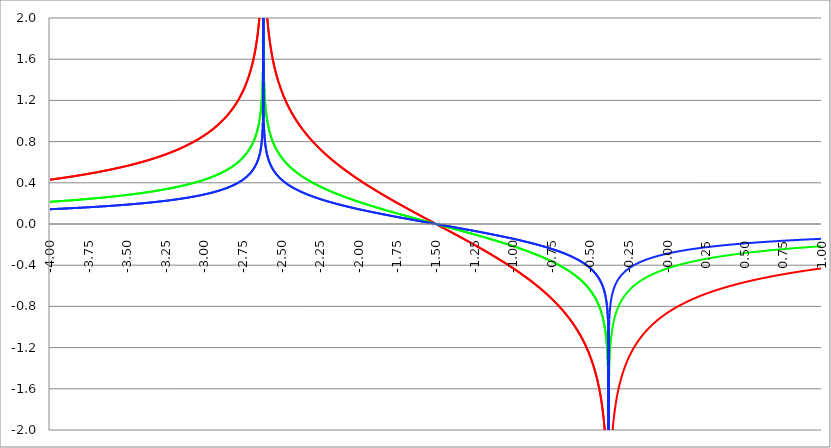
| Category | Series 1 | Series 0 | Series 2 |
|---|---|---|---|
| -4.0 | 0.43 | 0.215 | 0.143 |
| -3.9975 | 0.431 | 0.215 | 0.144 |
| -3.995 | 0.431 | 0.216 | 0.144 |
| -3.9925 | 0.432 | 0.216 | 0.144 |
| -3.99 | 0.432 | 0.216 | 0.144 |
| -3.9875 | 0.433 | 0.216 | 0.144 |
| -3.985 | 0.433 | 0.217 | 0.144 |
| -3.9825 | 0.434 | 0.217 | 0.145 |
| -3.98 | 0.434 | 0.217 | 0.145 |
| -3.9775 | 0.435 | 0.217 | 0.145 |
| -3.975000000000001 | 0.435 | 0.218 | 0.145 |
| -3.972500000000001 | 0.436 | 0.218 | 0.145 |
| -3.970000000000001 | 0.437 | 0.218 | 0.146 |
| -3.967500000000001 | 0.437 | 0.219 | 0.146 |
| -3.965000000000001 | 0.438 | 0.219 | 0.146 |
| -3.962500000000001 | 0.438 | 0.219 | 0.146 |
| -3.960000000000001 | 0.439 | 0.219 | 0.146 |
| -3.957500000000001 | 0.439 | 0.22 | 0.146 |
| -3.955000000000001 | 0.44 | 0.22 | 0.147 |
| -3.952500000000001 | 0.44 | 0.22 | 0.147 |
| -3.950000000000001 | 0.441 | 0.22 | 0.147 |
| -3.947500000000001 | 0.441 | 0.221 | 0.147 |
| -3.945000000000001 | 0.442 | 0.221 | 0.147 |
| -3.942500000000001 | 0.442 | 0.221 | 0.147 |
| -3.940000000000001 | 0.443 | 0.221 | 0.148 |
| -3.937500000000001 | 0.443 | 0.222 | 0.148 |
| -3.935000000000001 | 0.444 | 0.222 | 0.148 |
| -3.932500000000001 | 0.444 | 0.222 | 0.148 |
| -3.930000000000001 | 0.445 | 0.222 | 0.148 |
| -3.927500000000002 | 0.445 | 0.223 | 0.148 |
| -3.925000000000002 | 0.446 | 0.223 | 0.149 |
| -3.922500000000002 | 0.447 | 0.223 | 0.149 |
| -3.920000000000002 | 0.447 | 0.224 | 0.149 |
| -3.917500000000002 | 0.448 | 0.224 | 0.149 |
| -3.915000000000002 | 0.448 | 0.224 | 0.149 |
| -3.912500000000002 | 0.449 | 0.224 | 0.15 |
| -3.910000000000002 | 0.449 | 0.225 | 0.15 |
| -3.907500000000002 | 0.45 | 0.225 | 0.15 |
| -3.905000000000002 | 0.45 | 0.225 | 0.15 |
| -3.902500000000002 | 0.451 | 0.225 | 0.15 |
| -3.900000000000002 | 0.451 | 0.226 | 0.15 |
| -3.897500000000002 | 0.452 | 0.226 | 0.151 |
| -3.895000000000002 | 0.453 | 0.226 | 0.151 |
| -3.892500000000002 | 0.453 | 0.227 | 0.151 |
| -3.890000000000002 | 0.454 | 0.227 | 0.151 |
| -3.887500000000002 | 0.454 | 0.227 | 0.151 |
| -3.885000000000002 | 0.455 | 0.227 | 0.152 |
| -3.882500000000002 | 0.455 | 0.228 | 0.152 |
| -3.880000000000002 | 0.456 | 0.228 | 0.152 |
| -3.877500000000003 | 0.457 | 0.228 | 0.152 |
| -3.875000000000003 | 0.457 | 0.229 | 0.152 |
| -3.872500000000003 | 0.458 | 0.229 | 0.153 |
| -3.870000000000003 | 0.458 | 0.229 | 0.153 |
| -3.867500000000003 | 0.459 | 0.229 | 0.153 |
| -3.865000000000003 | 0.459 | 0.23 | 0.153 |
| -3.862500000000003 | 0.46 | 0.23 | 0.153 |
| -3.860000000000003 | 0.461 | 0.23 | 0.154 |
| -3.857500000000003 | 0.461 | 0.231 | 0.154 |
| -3.855000000000003 | 0.462 | 0.231 | 0.154 |
| -3.852500000000003 | 0.462 | 0.231 | 0.154 |
| -3.850000000000003 | 0.463 | 0.231 | 0.154 |
| -3.847500000000003 | 0.463 | 0.232 | 0.154 |
| -3.845000000000003 | 0.464 | 0.232 | 0.155 |
| -3.842500000000003 | 0.465 | 0.232 | 0.155 |
| -3.840000000000003 | 0.465 | 0.233 | 0.155 |
| -3.837500000000003 | 0.466 | 0.233 | 0.155 |
| -3.835000000000003 | 0.466 | 0.233 | 0.155 |
| -3.832500000000004 | 0.467 | 0.233 | 0.156 |
| -3.830000000000004 | 0.468 | 0.234 | 0.156 |
| -3.827500000000004 | 0.468 | 0.234 | 0.156 |
| -3.825000000000004 | 0.469 | 0.234 | 0.156 |
| -3.822500000000004 | 0.469 | 0.235 | 0.156 |
| -3.820000000000004 | 0.47 | 0.235 | 0.157 |
| -3.817500000000004 | 0.471 | 0.235 | 0.157 |
| -3.815000000000004 | 0.471 | 0.236 | 0.157 |
| -3.812500000000004 | 0.472 | 0.236 | 0.157 |
| -3.810000000000004 | 0.472 | 0.236 | 0.157 |
| -3.807500000000004 | 0.473 | 0.237 | 0.158 |
| -3.805000000000004 | 0.474 | 0.237 | 0.158 |
| -3.802500000000004 | 0.474 | 0.237 | 0.158 |
| -3.800000000000004 | 0.475 | 0.237 | 0.158 |
| -3.797500000000004 | 0.476 | 0.238 | 0.159 |
| -3.795000000000004 | 0.476 | 0.238 | 0.159 |
| -3.792500000000004 | 0.477 | 0.238 | 0.159 |
| -3.790000000000004 | 0.477 | 0.239 | 0.159 |
| -3.787500000000004 | 0.478 | 0.239 | 0.159 |
| -3.785000000000004 | 0.479 | 0.239 | 0.16 |
| -3.782500000000005 | 0.479 | 0.24 | 0.16 |
| -3.780000000000005 | 0.48 | 0.24 | 0.16 |
| -3.777500000000005 | 0.481 | 0.24 | 0.16 |
| -3.775000000000005 | 0.481 | 0.241 | 0.16 |
| -3.772500000000005 | 0.482 | 0.241 | 0.161 |
| -3.770000000000005 | 0.482 | 0.241 | 0.161 |
| -3.767500000000005 | 0.483 | 0.242 | 0.161 |
| -3.765000000000005 | 0.484 | 0.242 | 0.161 |
| -3.762500000000005 | 0.484 | 0.242 | 0.161 |
| -3.760000000000005 | 0.485 | 0.243 | 0.162 |
| -3.757500000000005 | 0.486 | 0.243 | 0.162 |
| -3.755000000000005 | 0.486 | 0.243 | 0.162 |
| -3.752500000000005 | 0.487 | 0.243 | 0.162 |
| -3.750000000000005 | 0.488 | 0.244 | 0.163 |
| -3.747500000000005 | 0.488 | 0.244 | 0.163 |
| -3.745000000000005 | 0.489 | 0.244 | 0.163 |
| -3.742500000000005 | 0.49 | 0.245 | 0.163 |
| -3.740000000000005 | 0.49 | 0.245 | 0.163 |
| -3.737500000000006 | 0.491 | 0.245 | 0.164 |
| -3.735000000000006 | 0.492 | 0.246 | 0.164 |
| -3.732500000000006 | 0.492 | 0.246 | 0.164 |
| -3.730000000000006 | 0.493 | 0.246 | 0.164 |
| -3.727500000000006 | 0.494 | 0.247 | 0.165 |
| -3.725000000000006 | 0.494 | 0.247 | 0.165 |
| -3.722500000000006 | 0.495 | 0.247 | 0.165 |
| -3.720000000000006 | 0.496 | 0.248 | 0.165 |
| -3.717500000000006 | 0.496 | 0.248 | 0.165 |
| -3.715000000000006 | 0.497 | 0.249 | 0.166 |
| -3.712500000000006 | 0.498 | 0.249 | 0.166 |
| -3.710000000000006 | 0.498 | 0.249 | 0.166 |
| -3.707500000000006 | 0.499 | 0.25 | 0.166 |
| -3.705000000000006 | 0.5 | 0.25 | 0.167 |
| -3.702500000000006 | 0.5 | 0.25 | 0.167 |
| -3.700000000000006 | 0.501 | 0.251 | 0.167 |
| -3.697500000000006 | 0.502 | 0.251 | 0.167 |
| -3.695000000000006 | 0.503 | 0.251 | 0.168 |
| -3.692500000000006 | 0.503 | 0.252 | 0.168 |
| -3.690000000000006 | 0.504 | 0.252 | 0.168 |
| -3.687500000000006 | 0.505 | 0.252 | 0.168 |
| -3.685000000000007 | 0.505 | 0.253 | 0.168 |
| -3.682500000000007 | 0.506 | 0.253 | 0.169 |
| -3.680000000000007 | 0.507 | 0.253 | 0.169 |
| -3.677500000000007 | 0.507 | 0.254 | 0.169 |
| -3.675000000000007 | 0.508 | 0.254 | 0.169 |
| -3.672500000000007 | 0.509 | 0.254 | 0.17 |
| -3.670000000000007 | 0.51 | 0.255 | 0.17 |
| -3.667500000000007 | 0.51 | 0.255 | 0.17 |
| -3.665000000000007 | 0.511 | 0.256 | 0.17 |
| -3.662500000000007 | 0.512 | 0.256 | 0.171 |
| -3.660000000000007 | 0.513 | 0.256 | 0.171 |
| -3.657500000000007 | 0.513 | 0.257 | 0.171 |
| -3.655000000000007 | 0.514 | 0.257 | 0.171 |
| -3.652500000000007 | 0.515 | 0.257 | 0.172 |
| -3.650000000000007 | 0.516 | 0.258 | 0.172 |
| -3.647500000000007 | 0.516 | 0.258 | 0.172 |
| -3.645000000000007 | 0.517 | 0.259 | 0.172 |
| -3.642500000000008 | 0.518 | 0.259 | 0.173 |
| -3.640000000000008 | 0.518 | 0.259 | 0.173 |
| -3.637500000000008 | 0.519 | 0.26 | 0.173 |
| -3.635000000000008 | 0.52 | 0.26 | 0.173 |
| -3.632500000000008 | 0.521 | 0.26 | 0.174 |
| -3.630000000000008 | 0.522 | 0.261 | 0.174 |
| -3.627500000000008 | 0.522 | 0.261 | 0.174 |
| -3.625000000000008 | 0.523 | 0.262 | 0.174 |
| -3.622500000000008 | 0.524 | 0.262 | 0.175 |
| -3.620000000000008 | 0.525 | 0.262 | 0.175 |
| -3.617500000000008 | 0.525 | 0.263 | 0.175 |
| -3.615000000000008 | 0.526 | 0.263 | 0.175 |
| -3.612500000000008 | 0.527 | 0.263 | 0.176 |
| -3.610000000000008 | 0.528 | 0.264 | 0.176 |
| -3.607500000000008 | 0.528 | 0.264 | 0.176 |
| -3.605000000000008 | 0.529 | 0.265 | 0.176 |
| -3.602500000000008 | 0.53 | 0.265 | 0.177 |
| -3.600000000000008 | 0.531 | 0.265 | 0.177 |
| -3.597500000000009 | 0.532 | 0.266 | 0.177 |
| -3.595000000000009 | 0.532 | 0.266 | 0.177 |
| -3.592500000000009 | 0.533 | 0.267 | 0.178 |
| -3.590000000000009 | 0.534 | 0.267 | 0.178 |
| -3.587500000000009 | 0.535 | 0.267 | 0.178 |
| -3.585000000000009 | 0.536 | 0.268 | 0.179 |
| -3.582500000000009 | 0.536 | 0.268 | 0.179 |
| -3.580000000000009 | 0.537 | 0.269 | 0.179 |
| -3.577500000000009 | 0.538 | 0.269 | 0.179 |
| -3.575000000000009 | 0.539 | 0.269 | 0.18 |
| -3.572500000000009 | 0.54 | 0.27 | 0.18 |
| -3.570000000000009 | 0.541 | 0.27 | 0.18 |
| -3.56750000000001 | 0.541 | 0.271 | 0.18 |
| -3.565000000000009 | 0.542 | 0.271 | 0.181 |
| -3.562500000000009 | 0.543 | 0.271 | 0.181 |
| -3.560000000000009 | 0.544 | 0.272 | 0.181 |
| -3.557500000000009 | 0.545 | 0.272 | 0.182 |
| -3.555000000000009 | 0.546 | 0.273 | 0.182 |
| -3.55250000000001 | 0.546 | 0.273 | 0.182 |
| -3.55000000000001 | 0.547 | 0.274 | 0.182 |
| -3.54750000000001 | 0.548 | 0.274 | 0.183 |
| -3.54500000000001 | 0.549 | 0.274 | 0.183 |
| -3.54250000000001 | 0.55 | 0.275 | 0.183 |
| -3.54000000000001 | 0.551 | 0.275 | 0.184 |
| -3.53750000000001 | 0.551 | 0.276 | 0.184 |
| -3.53500000000001 | 0.552 | 0.276 | 0.184 |
| -3.53250000000001 | 0.553 | 0.277 | 0.184 |
| -3.53000000000001 | 0.554 | 0.277 | 0.185 |
| -3.52750000000001 | 0.555 | 0.277 | 0.185 |
| -3.52500000000001 | 0.556 | 0.278 | 0.185 |
| -3.52250000000001 | 0.557 | 0.278 | 0.186 |
| -3.52000000000001 | 0.558 | 0.279 | 0.186 |
| -3.51750000000001 | 0.558 | 0.279 | 0.186 |
| -3.51500000000001 | 0.559 | 0.28 | 0.186 |
| -3.51250000000001 | 0.56 | 0.28 | 0.187 |
| -3.51000000000001 | 0.561 | 0.281 | 0.187 |
| -3.50750000000001 | 0.562 | 0.281 | 0.187 |
| -3.505000000000011 | 0.563 | 0.281 | 0.188 |
| -3.502500000000011 | 0.564 | 0.282 | 0.188 |
| -3.500000000000011 | 0.565 | 0.282 | 0.188 |
| -3.497500000000011 | 0.566 | 0.283 | 0.189 |
| -3.495000000000011 | 0.567 | 0.283 | 0.189 |
| -3.492500000000011 | 0.567 | 0.284 | 0.189 |
| -3.490000000000011 | 0.568 | 0.284 | 0.189 |
| -3.487500000000011 | 0.569 | 0.285 | 0.19 |
| -3.485000000000011 | 0.57 | 0.285 | 0.19 |
| -3.482500000000011 | 0.571 | 0.286 | 0.19 |
| -3.480000000000011 | 0.572 | 0.286 | 0.191 |
| -3.477500000000011 | 0.573 | 0.287 | 0.191 |
| -3.475000000000011 | 0.574 | 0.287 | 0.191 |
| -3.472500000000011 | 0.575 | 0.287 | 0.192 |
| -3.470000000000011 | 0.576 | 0.288 | 0.192 |
| -3.467500000000011 | 0.577 | 0.288 | 0.192 |
| -3.465000000000011 | 0.578 | 0.289 | 0.193 |
| -3.462500000000011 | 0.579 | 0.289 | 0.193 |
| -3.460000000000011 | 0.58 | 0.29 | 0.193 |
| -3.457500000000012 | 0.581 | 0.29 | 0.194 |
| -3.455000000000012 | 0.582 | 0.291 | 0.194 |
| -3.452500000000012 | 0.583 | 0.291 | 0.194 |
| -3.450000000000012 | 0.584 | 0.292 | 0.195 |
| -3.447500000000012 | 0.585 | 0.292 | 0.195 |
| -3.445000000000012 | 0.586 | 0.293 | 0.195 |
| -3.442500000000012 | 0.587 | 0.293 | 0.196 |
| -3.440000000000012 | 0.588 | 0.294 | 0.196 |
| -3.437500000000012 | 0.589 | 0.294 | 0.196 |
| -3.435000000000012 | 0.59 | 0.295 | 0.197 |
| -3.432500000000012 | 0.591 | 0.295 | 0.197 |
| -3.430000000000012 | 0.592 | 0.296 | 0.197 |
| -3.427500000000012 | 0.593 | 0.296 | 0.198 |
| -3.425000000000012 | 0.594 | 0.297 | 0.198 |
| -3.422500000000012 | 0.595 | 0.297 | 0.198 |
| -3.420000000000012 | 0.596 | 0.298 | 0.199 |
| -3.417500000000012 | 0.597 | 0.298 | 0.199 |
| -3.415000000000012 | 0.598 | 0.299 | 0.199 |
| -3.412500000000012 | 0.599 | 0.299 | 0.2 |
| -3.410000000000013 | 0.6 | 0.3 | 0.2 |
| -3.407500000000012 | 0.601 | 0.3 | 0.2 |
| -3.405000000000013 | 0.602 | 0.301 | 0.201 |
| -3.402500000000013 | 0.603 | 0.301 | 0.201 |
| -3.400000000000013 | 0.604 | 0.302 | 0.201 |
| -3.397500000000013 | 0.605 | 0.303 | 0.202 |
| -3.395000000000013 | 0.606 | 0.303 | 0.202 |
| -3.392500000000013 | 0.607 | 0.304 | 0.202 |
| -3.390000000000013 | 0.608 | 0.304 | 0.203 |
| -3.387500000000013 | 0.609 | 0.305 | 0.203 |
| -3.385000000000013 | 0.61 | 0.305 | 0.203 |
| -3.382500000000013 | 0.612 | 0.306 | 0.204 |
| -3.380000000000013 | 0.613 | 0.306 | 0.204 |
| -3.377500000000013 | 0.614 | 0.307 | 0.205 |
| -3.375000000000013 | 0.615 | 0.307 | 0.205 |
| -3.372500000000013 | 0.616 | 0.308 | 0.205 |
| -3.370000000000013 | 0.617 | 0.309 | 0.206 |
| -3.367500000000013 | 0.618 | 0.309 | 0.206 |
| -3.365000000000013 | 0.619 | 0.31 | 0.206 |
| -3.362500000000014 | 0.62 | 0.31 | 0.207 |
| -3.360000000000014 | 0.621 | 0.311 | 0.207 |
| -3.357500000000014 | 0.623 | 0.311 | 0.208 |
| -3.355000000000014 | 0.624 | 0.312 | 0.208 |
| -3.352500000000014 | 0.625 | 0.312 | 0.208 |
| -3.350000000000014 | 0.626 | 0.313 | 0.209 |
| -3.347500000000014 | 0.627 | 0.314 | 0.209 |
| -3.345000000000014 | 0.628 | 0.314 | 0.209 |
| -3.342500000000014 | 0.63 | 0.315 | 0.21 |
| -3.340000000000014 | 0.631 | 0.315 | 0.21 |
| -3.337500000000014 | 0.632 | 0.316 | 0.211 |
| -3.335000000000014 | 0.633 | 0.317 | 0.211 |
| -3.332500000000014 | 0.634 | 0.317 | 0.211 |
| -3.330000000000014 | 0.635 | 0.318 | 0.212 |
| -3.327500000000014 | 0.637 | 0.318 | 0.212 |
| -3.325000000000014 | 0.638 | 0.319 | 0.213 |
| -3.322500000000014 | 0.639 | 0.32 | 0.213 |
| -3.320000000000014 | 0.64 | 0.32 | 0.213 |
| -3.317500000000015 | 0.641 | 0.321 | 0.214 |
| -3.315000000000015 | 0.643 | 0.321 | 0.214 |
| -3.312500000000015 | 0.644 | 0.322 | 0.215 |
| -3.310000000000015 | 0.645 | 0.323 | 0.215 |
| -3.307500000000015 | 0.646 | 0.323 | 0.215 |
| -3.305000000000015 | 0.648 | 0.324 | 0.216 |
| -3.302500000000015 | 0.649 | 0.324 | 0.216 |
| -3.300000000000015 | 0.65 | 0.325 | 0.217 |
| -3.297500000000015 | 0.651 | 0.326 | 0.217 |
| -3.295000000000015 | 0.653 | 0.326 | 0.218 |
| -3.292500000000015 | 0.654 | 0.327 | 0.218 |
| -3.290000000000015 | 0.655 | 0.328 | 0.218 |
| -3.287500000000015 | 0.656 | 0.328 | 0.219 |
| -3.285000000000015 | 0.658 | 0.329 | 0.219 |
| -3.282500000000015 | 0.659 | 0.33 | 0.22 |
| -3.280000000000015 | 0.66 | 0.33 | 0.22 |
| -3.277500000000015 | 0.662 | 0.331 | 0.221 |
| -3.275000000000015 | 0.663 | 0.331 | 0.221 |
| -3.272500000000015 | 0.664 | 0.332 | 0.221 |
| -3.270000000000016 | 0.666 | 0.333 | 0.222 |
| -3.267500000000015 | 0.667 | 0.333 | 0.222 |
| -3.265000000000016 | 0.668 | 0.334 | 0.223 |
| -3.262500000000016 | 0.67 | 0.335 | 0.223 |
| -3.260000000000016 | 0.671 | 0.335 | 0.224 |
| -3.257500000000016 | 0.672 | 0.336 | 0.224 |
| -3.255000000000016 | 0.674 | 0.337 | 0.225 |
| -3.252500000000016 | 0.675 | 0.338 | 0.225 |
| -3.250000000000016 | 0.676 | 0.338 | 0.225 |
| -3.247500000000016 | 0.678 | 0.339 | 0.226 |
| -3.245000000000016 | 0.679 | 0.34 | 0.226 |
| -3.242500000000016 | 0.681 | 0.34 | 0.227 |
| -3.240000000000016 | 0.682 | 0.341 | 0.227 |
| -3.237500000000016 | 0.683 | 0.342 | 0.228 |
| -3.235000000000016 | 0.685 | 0.342 | 0.228 |
| -3.232500000000016 | 0.686 | 0.343 | 0.229 |
| -3.230000000000016 | 0.688 | 0.344 | 0.229 |
| -3.227500000000016 | 0.689 | 0.345 | 0.23 |
| -3.225000000000016 | 0.691 | 0.345 | 0.23 |
| -3.222500000000016 | 0.692 | 0.346 | 0.231 |
| -3.220000000000016 | 0.693 | 0.347 | 0.231 |
| -3.217500000000016 | 0.695 | 0.347 | 0.232 |
| -3.215000000000017 | 0.696 | 0.348 | 0.232 |
| -3.212500000000017 | 0.698 | 0.349 | 0.233 |
| -3.210000000000017 | 0.699 | 0.35 | 0.233 |
| -3.207500000000016 | 0.701 | 0.35 | 0.234 |
| -3.205000000000017 | 0.702 | 0.351 | 0.234 |
| -3.202500000000017 | 0.704 | 0.352 | 0.235 |
| -3.200000000000017 | 0.705 | 0.353 | 0.235 |
| -3.197500000000017 | 0.707 | 0.353 | 0.236 |
| -3.195000000000017 | 0.708 | 0.354 | 0.236 |
| -3.192500000000017 | 0.71 | 0.355 | 0.237 |
| -3.190000000000017 | 0.712 | 0.356 | 0.237 |
| -3.187500000000017 | 0.713 | 0.357 | 0.238 |
| -3.185000000000017 | 0.715 | 0.357 | 0.238 |
| -3.182500000000017 | 0.716 | 0.358 | 0.239 |
| -3.180000000000017 | 0.718 | 0.359 | 0.239 |
| -3.177500000000017 | 0.719 | 0.36 | 0.24 |
| -3.175000000000018 | 0.721 | 0.361 | 0.24 |
| -3.172500000000018 | 0.723 | 0.361 | 0.241 |
| -3.170000000000018 | 0.724 | 0.362 | 0.241 |
| -3.167500000000017 | 0.726 | 0.363 | 0.242 |
| -3.165000000000018 | 0.728 | 0.364 | 0.243 |
| -3.162500000000018 | 0.729 | 0.365 | 0.243 |
| -3.160000000000018 | 0.731 | 0.365 | 0.244 |
| -3.157500000000018 | 0.733 | 0.366 | 0.244 |
| -3.155000000000018 | 0.734 | 0.367 | 0.245 |
| -3.152500000000018 | 0.736 | 0.368 | 0.245 |
| -3.150000000000018 | 0.738 | 0.369 | 0.246 |
| -3.147500000000018 | 0.739 | 0.37 | 0.246 |
| -3.145000000000018 | 0.741 | 0.371 | 0.247 |
| -3.142500000000018 | 0.743 | 0.371 | 0.248 |
| -3.140000000000018 | 0.744 | 0.372 | 0.248 |
| -3.137500000000018 | 0.746 | 0.373 | 0.249 |
| -3.135000000000018 | 0.748 | 0.374 | 0.249 |
| -3.132500000000018 | 0.75 | 0.375 | 0.25 |
| -3.130000000000019 | 0.751 | 0.376 | 0.25 |
| -3.127500000000018 | 0.753 | 0.377 | 0.251 |
| -3.125000000000019 | 0.755 | 0.378 | 0.252 |
| -3.122500000000019 | 0.757 | 0.378 | 0.252 |
| -3.120000000000019 | 0.759 | 0.379 | 0.253 |
| -3.117500000000019 | 0.761 | 0.38 | 0.254 |
| -3.115000000000019 | 0.762 | 0.381 | 0.254 |
| -3.112500000000019 | 0.764 | 0.382 | 0.255 |
| -3.110000000000019 | 0.766 | 0.383 | 0.255 |
| -3.10750000000002 | 0.768 | 0.384 | 0.256 |
| -3.10500000000002 | 0.77 | 0.385 | 0.257 |
| -3.10250000000002 | 0.772 | 0.386 | 0.257 |
| -3.10000000000002 | 0.774 | 0.387 | 0.258 |
| -3.09750000000002 | 0.776 | 0.388 | 0.259 |
| -3.095000000000019 | 0.777 | 0.389 | 0.259 |
| -3.092500000000019 | 0.779 | 0.39 | 0.26 |
| -3.090000000000019 | 0.781 | 0.391 | 0.26 |
| -3.08750000000002 | 0.783 | 0.392 | 0.261 |
| -3.085000000000019 | 0.785 | 0.393 | 0.262 |
| -3.08250000000002 | 0.787 | 0.394 | 0.262 |
| -3.08000000000002 | 0.789 | 0.395 | 0.263 |
| -3.07750000000002 | 0.791 | 0.396 | 0.264 |
| -3.07500000000002 | 0.793 | 0.397 | 0.264 |
| -3.07250000000002 | 0.795 | 0.398 | 0.265 |
| -3.07000000000002 | 0.797 | 0.399 | 0.266 |
| -3.06750000000002 | 0.799 | 0.4 | 0.266 |
| -3.06500000000002 | 0.802 | 0.401 | 0.267 |
| -3.06250000000002 | 0.804 | 0.402 | 0.268 |
| -3.06000000000002 | 0.806 | 0.403 | 0.269 |
| -3.05750000000002 | 0.808 | 0.404 | 0.269 |
| -3.05500000000002 | 0.81 | 0.405 | 0.27 |
| -3.05250000000002 | 0.812 | 0.406 | 0.271 |
| -3.05000000000002 | 0.814 | 0.407 | 0.271 |
| -3.04750000000002 | 0.816 | 0.408 | 0.272 |
| -3.04500000000002 | 0.819 | 0.409 | 0.273 |
| -3.04250000000002 | 0.821 | 0.41 | 0.274 |
| -3.04000000000002 | 0.823 | 0.412 | 0.274 |
| -3.037500000000021 | 0.825 | 0.413 | 0.275 |
| -3.035000000000021 | 0.828 | 0.414 | 0.276 |
| -3.032500000000021 | 0.83 | 0.415 | 0.277 |
| -3.030000000000021 | 0.832 | 0.416 | 0.277 |
| -3.027500000000021 | 0.834 | 0.417 | 0.278 |
| -3.025000000000021 | 0.837 | 0.418 | 0.279 |
| -3.022500000000021 | 0.839 | 0.42 | 0.28 |
| -3.020000000000021 | 0.841 | 0.421 | 0.28 |
| -3.017500000000021 | 0.844 | 0.422 | 0.281 |
| -3.015000000000021 | 0.846 | 0.423 | 0.282 |
| -3.012500000000021 | 0.849 | 0.424 | 0.283 |
| -3.010000000000021 | 0.851 | 0.425 | 0.284 |
| -3.007500000000021 | 0.853 | 0.427 | 0.284 |
| -3.005000000000021 | 0.856 | 0.428 | 0.285 |
| -3.002500000000021 | 0.858 | 0.429 | 0.286 |
| -3.000000000000021 | 0.861 | 0.43 | 0.287 |
| -2.997500000000021 | 0.863 | 0.432 | 0.288 |
| -2.995000000000021 | 0.866 | 0.433 | 0.289 |
| -2.992500000000021 | 0.868 | 0.434 | 0.289 |
| -2.990000000000021 | 0.871 | 0.435 | 0.29 |
| -2.987500000000022 | 0.874 | 0.437 | 0.291 |
| -2.985000000000022 | 0.876 | 0.438 | 0.292 |
| -2.982500000000022 | 0.879 | 0.439 | 0.293 |
| -2.980000000000022 | 0.881 | 0.441 | 0.294 |
| -2.977500000000022 | 0.884 | 0.442 | 0.295 |
| -2.975000000000022 | 0.887 | 0.443 | 0.296 |
| -2.972500000000022 | 0.89 | 0.445 | 0.297 |
| -2.970000000000022 | 0.892 | 0.446 | 0.297 |
| -2.967500000000022 | 0.895 | 0.448 | 0.298 |
| -2.965000000000022 | 0.898 | 0.449 | 0.299 |
| -2.962500000000022 | 0.901 | 0.45 | 0.3 |
| -2.960000000000022 | 0.903 | 0.452 | 0.301 |
| -2.957500000000022 | 0.906 | 0.453 | 0.302 |
| -2.955000000000022 | 0.909 | 0.455 | 0.303 |
| -2.952500000000022 | 0.912 | 0.456 | 0.304 |
| -2.950000000000022 | 0.915 | 0.457 | 0.305 |
| -2.947500000000022 | 0.918 | 0.459 | 0.306 |
| -2.945000000000022 | 0.921 | 0.46 | 0.307 |
| -2.942500000000023 | 0.924 | 0.462 | 0.308 |
| -2.940000000000023 | 0.927 | 0.463 | 0.309 |
| -2.937500000000023 | 0.93 | 0.465 | 0.31 |
| -2.935000000000023 | 0.933 | 0.466 | 0.311 |
| -2.932500000000023 | 0.936 | 0.468 | 0.312 |
| -2.930000000000023 | 0.939 | 0.47 | 0.313 |
| -2.927500000000023 | 0.942 | 0.471 | 0.314 |
| -2.925000000000023 | 0.946 | 0.473 | 0.315 |
| -2.922500000000023 | 0.949 | 0.474 | 0.316 |
| -2.920000000000023 | 0.952 | 0.476 | 0.317 |
| -2.917500000000023 | 0.955 | 0.478 | 0.318 |
| -2.915000000000023 | 0.959 | 0.479 | 0.32 |
| -2.912500000000023 | 0.962 | 0.481 | 0.321 |
| -2.910000000000023 | 0.965 | 0.483 | 0.322 |
| -2.907500000000023 | 0.969 | 0.484 | 0.323 |
| -2.905000000000023 | 0.972 | 0.486 | 0.324 |
| -2.902500000000023 | 0.976 | 0.488 | 0.325 |
| -2.900000000000023 | 0.979 | 0.49 | 0.326 |
| -2.897500000000023 | 0.983 | 0.491 | 0.328 |
| -2.895000000000023 | 0.986 | 0.493 | 0.329 |
| -2.892500000000024 | 0.99 | 0.495 | 0.33 |
| -2.890000000000024 | 0.994 | 0.497 | 0.331 |
| -2.887500000000024 | 0.997 | 0.499 | 0.332 |
| -2.885000000000024 | 1.001 | 0.5 | 0.334 |
| -2.882500000000024 | 1.005 | 0.502 | 0.335 |
| -2.880000000000024 | 1.008 | 0.504 | 0.336 |
| -2.877500000000024 | 1.012 | 0.506 | 0.337 |
| -2.875000000000024 | 1.016 | 0.508 | 0.339 |
| -2.872500000000024 | 1.02 | 0.51 | 0.34 |
| -2.870000000000024 | 1.024 | 0.512 | 0.341 |
| -2.867500000000024 | 1.028 | 0.514 | 0.343 |
| -2.865000000000024 | 1.032 | 0.516 | 0.344 |
| -2.862500000000024 | 1.036 | 0.518 | 0.345 |
| -2.860000000000024 | 1.04 | 0.52 | 0.347 |
| -2.857500000000024 | 1.045 | 0.522 | 0.348 |
| -2.855000000000024 | 1.049 | 0.524 | 0.35 |
| -2.852500000000024 | 1.053 | 0.527 | 0.351 |
| -2.850000000000024 | 1.057 | 0.529 | 0.352 |
| -2.847500000000025 | 1.062 | 0.531 | 0.354 |
| -2.845000000000025 | 1.066 | 0.533 | 0.355 |
| -2.842500000000025 | 1.071 | 0.535 | 0.357 |
| -2.840000000000025 | 1.075 | 0.538 | 0.358 |
| -2.837500000000025 | 1.08 | 0.54 | 0.36 |
| -2.835000000000025 | 1.085 | 0.542 | 0.362 |
| -2.832500000000025 | 1.089 | 0.545 | 0.363 |
| -2.830000000000025 | 1.094 | 0.547 | 0.365 |
| -2.827500000000025 | 1.099 | 0.55 | 0.366 |
| -2.825000000000025 | 1.104 | 0.552 | 0.368 |
| -2.822500000000025 | 1.109 | 0.554 | 0.37 |
| -2.820000000000025 | 1.114 | 0.557 | 0.371 |
| -2.817500000000025 | 1.119 | 0.56 | 0.373 |
| -2.815000000000025 | 1.124 | 0.562 | 0.375 |
| -2.812500000000025 | 1.129 | 0.565 | 0.376 |
| -2.810000000000025 | 1.135 | 0.567 | 0.378 |
| -2.807500000000025 | 1.14 | 0.57 | 0.38 |
| -2.805000000000025 | 1.146 | 0.573 | 0.382 |
| -2.802500000000025 | 1.151 | 0.576 | 0.384 |
| -2.800000000000026 | 1.157 | 0.578 | 0.386 |
| -2.797500000000026 | 1.163 | 0.581 | 0.388 |
| -2.795000000000026 | 1.168 | 0.584 | 0.389 |
| -2.792500000000026 | 1.174 | 0.587 | 0.391 |
| -2.790000000000026 | 1.18 | 0.59 | 0.393 |
| -2.787500000000026 | 1.186 | 0.593 | 0.395 |
| -2.785000000000026 | 1.193 | 0.596 | 0.398 |
| -2.782500000000026 | 1.199 | 0.599 | 0.4 |
| -2.780000000000026 | 1.205 | 0.603 | 0.402 |
| -2.777500000000026 | 1.212 | 0.606 | 0.404 |
| -2.775000000000026 | 1.218 | 0.609 | 0.406 |
| -2.772500000000026 | 1.225 | 0.613 | 0.408 |
| -2.770000000000026 | 1.232 | 0.616 | 0.411 |
| -2.767500000000026 | 1.239 | 0.619 | 0.413 |
| -2.765000000000026 | 1.246 | 0.623 | 0.415 |
| -2.762500000000026 | 1.253 | 0.627 | 0.418 |
| -2.760000000000026 | 1.26 | 0.63 | 0.42 |
| -2.757500000000026 | 1.268 | 0.634 | 0.423 |
| -2.755000000000026 | 1.276 | 0.638 | 0.425 |
| -2.752500000000027 | 1.283 | 0.642 | 0.428 |
| -2.750000000000027 | 1.291 | 0.646 | 0.43 |
| -2.747500000000026 | 1.299 | 0.65 | 0.433 |
| -2.745000000000027 | 1.308 | 0.654 | 0.436 |
| -2.742500000000027 | 1.316 | 0.658 | 0.439 |
| -2.740000000000027 | 1.325 | 0.662 | 0.442 |
| -2.737500000000027 | 1.333 | 0.667 | 0.444 |
| -2.735000000000027 | 1.342 | 0.671 | 0.447 |
| -2.732500000000027 | 1.352 | 0.676 | 0.451 |
| -2.730000000000027 | 1.361 | 0.68 | 0.454 |
| -2.727500000000027 | 1.371 | 0.685 | 0.457 |
| -2.725000000000027 | 1.38 | 0.69 | 0.46 |
| -2.722500000000027 | 1.391 | 0.695 | 0.464 |
| -2.720000000000027 | 1.401 | 0.7 | 0.467 |
| -2.717500000000027 | 1.411 | 0.706 | 0.47 |
| -2.715000000000027 | 1.422 | 0.711 | 0.474 |
| -2.712500000000027 | 1.434 | 0.717 | 0.478 |
| -2.710000000000027 | 1.445 | 0.723 | 0.482 |
| -2.707500000000027 | 1.457 | 0.728 | 0.486 |
| -2.705000000000028 | 1.469 | 0.735 | 0.49 |
| -2.702500000000028 | 1.482 | 0.741 | 0.494 |
| -2.700000000000028 | 1.495 | 0.747 | 0.498 |
| -2.697500000000028 | 1.508 | 0.754 | 0.503 |
| -2.695000000000028 | 1.522 | 0.761 | 0.507 |
| -2.692500000000028 | 1.536 | 0.768 | 0.512 |
| -2.690000000000028 | 1.551 | 0.775 | 0.517 |
| -2.687500000000028 | 1.566 | 0.783 | 0.522 |
| -2.685000000000028 | 1.582 | 0.791 | 0.527 |
| -2.682500000000028 | 1.599 | 0.799 | 0.533 |
| -2.680000000000028 | 1.616 | 0.808 | 0.539 |
| -2.677500000000028 | 1.634 | 0.817 | 0.545 |
| -2.675000000000028 | 1.653 | 0.826 | 0.551 |
| -2.672500000000028 | 1.672 | 0.836 | 0.557 |
| -2.670000000000028 | 1.693 | 0.846 | 0.564 |
| -2.667500000000028 | 1.714 | 0.857 | 0.571 |
| -2.665000000000028 | 1.737 | 0.868 | 0.579 |
| -2.662500000000028 | 1.761 | 0.88 | 0.587 |
| -2.660000000000028 | 1.786 | 0.893 | 0.595 |
| -2.657500000000029 | 1.813 | 0.907 | 0.604 |
| -2.655000000000029 | 1.842 | 0.921 | 0.614 |
| -2.652500000000029 | 1.873 | 0.936 | 0.624 |
| -2.650000000000029 | 1.906 | 0.953 | 0.635 |
| -2.647500000000029 | 1.942 | 0.971 | 0.647 |
| -2.645000000000029 | 1.981 | 0.991 | 0.66 |
| -2.642500000000029 | 2.024 | 1.012 | 0.675 |
| -2.640000000000029 | 2.072 | 1.036 | 0.691 |
| -2.637500000000029 | 2.125 | 1.063 | 0.708 |
| -2.635000000000029 | 2.186 | 1.093 | 0.729 |
| -2.632500000000029 | 2.257 | 1.129 | 0.752 |
| -2.630000000000029 | 2.341 | 1.171 | 0.78 |
| -2.62750000000003 | 2.446 | 1.223 | 0.815 |
| -2.625000000000029 | 2.582 | 1.291 | 0.861 |
| -2.622500000000029 | 2.781 | 1.39 | 0.927 |
| -2.620000000000029 | 3.147 | 1.574 | 1.049 |
| -2.617500000000029 | 10 | 10 | 10 |
| -2.615000000000029 | 2.952 | 1.476 | 0.984 |
| -2.612500000000029 | 2.683 | 1.341 | 0.894 |
| -2.61000000000003 | 2.516 | 1.258 | 0.839 |
| -2.60750000000003 | 2.394 | 1.197 | 0.798 |
| -2.60500000000003 | 2.298 | 1.149 | 0.766 |
| -2.60250000000003 | 2.219 | 1.11 | 0.74 |
| -2.60000000000003 | 2.152 | 1.076 | 0.717 |
| -2.59750000000003 | 2.093 | 1.047 | 0.698 |
| -2.59500000000003 | 2.042 | 1.021 | 0.681 |
| -2.59250000000003 | 1.995 | 0.998 | 0.665 |
| -2.59000000000003 | 1.953 | 0.976 | 0.651 |
| -2.58750000000003 | 1.914 | 0.957 | 0.638 |
| -2.58500000000003 | 1.878 | 0.939 | 0.626 |
| -2.58250000000003 | 1.845 | 0.923 | 0.615 |
| -2.58000000000003 | 1.814 | 0.907 | 0.605 |
| -2.57750000000003 | 1.785 | 0.893 | 0.595 |
| -2.57500000000003 | 1.758 | 0.879 | 0.586 |
| -2.57250000000003 | 1.732 | 0.866 | 0.577 |
| -2.57000000000003 | 1.708 | 0.854 | 0.569 |
| -2.56750000000003 | 1.685 | 0.842 | 0.562 |
| -2.565000000000031 | 1.663 | 0.831 | 0.554 |
| -2.562500000000031 | 1.641 | 0.821 | 0.547 |
| -2.560000000000031 | 1.621 | 0.811 | 0.54 |
| -2.557500000000031 | 1.602 | 0.801 | 0.534 |
| -2.555000000000031 | 1.583 | 0.792 | 0.528 |
| -2.552500000000031 | 1.565 | 0.783 | 0.522 |
| -2.550000000000031 | 1.548 | 0.774 | 0.516 |
| -2.547500000000031 | 1.531 | 0.766 | 0.51 |
| -2.545000000000031 | 1.515 | 0.758 | 0.505 |
| -2.542500000000031 | 1.5 | 0.75 | 0.5 |
| -2.540000000000031 | 1.485 | 0.742 | 0.495 |
| -2.537500000000031 | 1.47 | 0.735 | 0.49 |
| -2.535000000000031 | 1.456 | 0.728 | 0.485 |
| -2.532500000000031 | 1.442 | 0.721 | 0.481 |
| -2.530000000000031 | 1.429 | 0.714 | 0.476 |
| -2.527500000000031 | 1.416 | 0.708 | 0.472 |
| -2.525000000000031 | 1.403 | 0.701 | 0.468 |
| -2.522500000000031 | 1.391 | 0.695 | 0.464 |
| -2.520000000000032 | 1.378 | 0.689 | 0.459 |
| -2.517500000000032 | 1.367 | 0.683 | 0.456 |
| -2.515000000000032 | 1.355 | 0.678 | 0.452 |
| -2.512500000000032 | 1.344 | 0.672 | 0.448 |
| -2.510000000000032 | 1.333 | 0.666 | 0.444 |
| -2.507500000000032 | 1.322 | 0.661 | 0.441 |
| -2.505000000000032 | 1.312 | 0.656 | 0.437 |
| -2.502500000000032 | 1.301 | 0.651 | 0.434 |
| -2.500000000000032 | 1.291 | 0.646 | 0.43 |
| -2.497500000000032 | 1.281 | 0.641 | 0.427 |
| -2.495000000000032 | 1.272 | 0.636 | 0.424 |
| -2.492500000000032 | 1.262 | 0.631 | 0.421 |
| -2.490000000000032 | 1.253 | 0.626 | 0.418 |
| -2.487500000000032 | 1.244 | 0.622 | 0.415 |
| -2.485000000000032 | 1.235 | 0.617 | 0.412 |
| -2.482500000000032 | 1.226 | 0.613 | 0.409 |
| -2.480000000000032 | 1.217 | 0.608 | 0.406 |
| -2.477500000000032 | 1.208 | 0.604 | 0.403 |
| -2.475000000000032 | 1.2 | 0.6 | 0.4 |
| -2.472500000000033 | 1.192 | 0.596 | 0.397 |
| -2.470000000000033 | 1.184 | 0.592 | 0.395 |
| -2.467500000000032 | 1.176 | 0.588 | 0.392 |
| -2.465000000000033 | 1.168 | 0.584 | 0.389 |
| -2.462500000000033 | 1.16 | 0.58 | 0.387 |
| -2.460000000000033 | 1.152 | 0.576 | 0.384 |
| -2.457500000000033 | 1.145 | 0.572 | 0.382 |
| -2.455000000000033 | 1.137 | 0.569 | 0.379 |
| -2.452500000000033 | 1.13 | 0.565 | 0.377 |
| -2.450000000000033 | 1.123 | 0.561 | 0.374 |
| -2.447500000000033 | 1.115 | 0.558 | 0.372 |
| -2.445000000000033 | 1.108 | 0.554 | 0.369 |
| -2.442500000000033 | 1.101 | 0.551 | 0.367 |
| -2.440000000000033 | 1.095 | 0.547 | 0.365 |
| -2.437500000000033 | 1.088 | 0.544 | 0.363 |
| -2.435000000000033 | 1.081 | 0.541 | 0.36 |
| -2.432500000000033 | 1.074 | 0.537 | 0.358 |
| -2.430000000000033 | 1.068 | 0.534 | 0.356 |
| -2.427500000000033 | 1.061 | 0.531 | 0.354 |
| -2.425000000000034 | 1.055 | 0.528 | 0.352 |
| -2.422500000000034 | 1.049 | 0.524 | 0.35 |
| -2.420000000000034 | 1.043 | 0.521 | 0.348 |
| -2.417500000000034 | 1.036 | 0.518 | 0.345 |
| -2.415000000000034 | 1.03 | 0.515 | 0.343 |
| -2.412500000000034 | 1.024 | 0.512 | 0.341 |
| -2.410000000000034 | 1.018 | 0.509 | 0.339 |
| -2.407500000000034 | 1.012 | 0.506 | 0.337 |
| -2.405000000000034 | 1.007 | 0.503 | 0.336 |
| -2.402500000000034 | 1.001 | 0.5 | 0.334 |
| -2.400000000000034 | 0.995 | 0.498 | 0.332 |
| -2.397500000000034 | 0.989 | 0.495 | 0.33 |
| -2.395000000000034 | 0.984 | 0.492 | 0.328 |
| -2.392500000000034 | 0.978 | 0.489 | 0.326 |
| -2.390000000000034 | 0.973 | 0.486 | 0.324 |
| -2.387500000000034 | 0.967 | 0.484 | 0.322 |
| -2.385000000000034 | 0.962 | 0.481 | 0.321 |
| -2.382500000000034 | 0.957 | 0.478 | 0.319 |
| -2.380000000000034 | 0.951 | 0.476 | 0.317 |
| -2.377500000000035 | 0.946 | 0.473 | 0.315 |
| -2.375000000000035 | 0.941 | 0.471 | 0.314 |
| -2.372500000000035 | 0.936 | 0.468 | 0.312 |
| -2.370000000000035 | 0.931 | 0.465 | 0.31 |
| -2.367500000000035 | 0.926 | 0.463 | 0.309 |
| -2.365000000000035 | 0.921 | 0.46 | 0.307 |
| -2.362500000000035 | 0.916 | 0.458 | 0.305 |
| -2.360000000000035 | 0.911 | 0.455 | 0.304 |
| -2.357500000000035 | 0.906 | 0.453 | 0.302 |
| -2.355000000000035 | 0.901 | 0.451 | 0.3 |
| -2.352500000000035 | 0.896 | 0.448 | 0.299 |
| -2.350000000000035 | 0.892 | 0.446 | 0.297 |
| -2.347500000000035 | 0.887 | 0.443 | 0.296 |
| -2.345000000000035 | 0.882 | 0.441 | 0.294 |
| -2.342500000000035 | 0.878 | 0.439 | 0.293 |
| -2.340000000000035 | 0.873 | 0.436 | 0.291 |
| -2.337500000000035 | 0.868 | 0.434 | 0.289 |
| -2.335000000000035 | 0.864 | 0.432 | 0.288 |
| -2.332500000000035 | 0.859 | 0.43 | 0.286 |
| -2.330000000000036 | 0.855 | 0.427 | 0.285 |
| -2.327500000000036 | 0.85 | 0.425 | 0.283 |
| -2.325000000000036 | 0.846 | 0.423 | 0.282 |
| -2.322500000000036 | 0.842 | 0.421 | 0.281 |
| -2.320000000000036 | 0.837 | 0.419 | 0.279 |
| -2.317500000000036 | 0.833 | 0.416 | 0.278 |
| -2.315000000000036 | 0.829 | 0.414 | 0.276 |
| -2.312500000000036 | 0.824 | 0.412 | 0.275 |
| -2.310000000000036 | 0.82 | 0.41 | 0.273 |
| -2.307500000000036 | 0.816 | 0.408 | 0.272 |
| -2.305000000000036 | 0.812 | 0.406 | 0.271 |
| -2.302500000000036 | 0.808 | 0.404 | 0.269 |
| -2.300000000000036 | 0.804 | 0.402 | 0.268 |
| -2.297500000000036 | 0.8 | 0.4 | 0.267 |
| -2.295000000000036 | 0.795 | 0.398 | 0.265 |
| -2.292500000000036 | 0.791 | 0.396 | 0.264 |
| -2.290000000000036 | 0.787 | 0.394 | 0.262 |
| -2.287500000000036 | 0.783 | 0.392 | 0.261 |
| -2.285000000000036 | 0.779 | 0.39 | 0.26 |
| -2.282500000000036 | 0.776 | 0.388 | 0.259 |
| -2.280000000000036 | 0.772 | 0.386 | 0.257 |
| -2.277500000000036 | 0.768 | 0.384 | 0.256 |
| -2.275000000000037 | 0.764 | 0.382 | 0.255 |
| -2.272500000000037 | 0.76 | 0.38 | 0.253 |
| -2.270000000000037 | 0.756 | 0.378 | 0.252 |
| -2.267500000000036 | 0.752 | 0.376 | 0.251 |
| -2.265000000000037 | 0.749 | 0.374 | 0.25 |
| -2.262500000000037 | 0.745 | 0.372 | 0.248 |
| -2.260000000000037 | 0.741 | 0.371 | 0.247 |
| -2.257500000000037 | 0.737 | 0.369 | 0.246 |
| -2.255000000000037 | 0.734 | 0.367 | 0.245 |
| -2.252500000000037 | 0.73 | 0.365 | 0.243 |
| -2.250000000000037 | 0.726 | 0.363 | 0.242 |
| -2.247500000000037 | 0.723 | 0.361 | 0.241 |
| -2.245000000000037 | 0.719 | 0.36 | 0.24 |
| -2.242500000000037 | 0.716 | 0.358 | 0.239 |
| -2.240000000000037 | 0.712 | 0.356 | 0.237 |
| -2.237500000000037 | 0.709 | 0.354 | 0.236 |
| -2.235000000000038 | 0.705 | 0.353 | 0.235 |
| -2.232500000000038 | 0.701 | 0.351 | 0.234 |
| -2.230000000000038 | 0.698 | 0.349 | 0.233 |
| -2.227500000000037 | 0.695 | 0.347 | 0.232 |
| -2.225000000000038 | 0.691 | 0.346 | 0.23 |
| -2.222500000000038 | 0.688 | 0.344 | 0.229 |
| -2.220000000000038 | 0.684 | 0.342 | 0.228 |
| -2.217500000000038 | 0.681 | 0.34 | 0.227 |
| -2.215000000000038 | 0.677 | 0.339 | 0.226 |
| -2.212500000000038 | 0.674 | 0.337 | 0.225 |
| -2.210000000000038 | 0.671 | 0.335 | 0.224 |
| -2.207500000000038 | 0.667 | 0.334 | 0.222 |
| -2.205000000000038 | 0.664 | 0.332 | 0.221 |
| -2.202500000000038 | 0.661 | 0.33 | 0.22 |
| -2.200000000000038 | 0.657 | 0.329 | 0.219 |
| -2.197500000000038 | 0.654 | 0.327 | 0.218 |
| -2.195000000000038 | 0.651 | 0.325 | 0.217 |
| -2.192500000000038 | 0.648 | 0.324 | 0.216 |
| -2.190000000000039 | 0.644 | 0.322 | 0.215 |
| -2.187500000000038 | 0.641 | 0.321 | 0.214 |
| -2.185000000000039 | 0.638 | 0.319 | 0.213 |
| -2.182500000000039 | 0.635 | 0.317 | 0.212 |
| -2.180000000000039 | 0.632 | 0.316 | 0.211 |
| -2.177500000000039 | 0.628 | 0.314 | 0.209 |
| -2.175000000000039 | 0.625 | 0.313 | 0.208 |
| -2.172500000000039 | 0.622 | 0.311 | 0.207 |
| -2.170000000000039 | 0.619 | 0.309 | 0.206 |
| -2.16750000000004 | 0.616 | 0.308 | 0.205 |
| -2.16500000000004 | 0.613 | 0.306 | 0.204 |
| -2.16250000000004 | 0.61 | 0.305 | 0.203 |
| -2.16000000000004 | 0.607 | 0.303 | 0.202 |
| -2.15750000000004 | 0.604 | 0.302 | 0.201 |
| -2.155000000000039 | 0.6 | 0.3 | 0.2 |
| -2.152500000000039 | 0.597 | 0.299 | 0.199 |
| -2.150000000000039 | 0.594 | 0.297 | 0.198 |
| -2.14750000000004 | 0.591 | 0.296 | 0.197 |
| -2.14500000000004 | 0.588 | 0.294 | 0.196 |
| -2.14250000000004 | 0.585 | 0.293 | 0.195 |
| -2.14000000000004 | 0.582 | 0.291 | 0.194 |
| -2.13750000000004 | 0.579 | 0.29 | 0.193 |
| -2.13500000000004 | 0.576 | 0.288 | 0.192 |
| -2.13250000000004 | 0.574 | 0.287 | 0.191 |
| -2.13000000000004 | 0.571 | 0.285 | 0.19 |
| -2.12750000000004 | 0.568 | 0.284 | 0.189 |
| -2.12500000000004 | 0.565 | 0.282 | 0.188 |
| -2.12250000000004 | 0.562 | 0.281 | 0.187 |
| -2.12000000000004 | 0.559 | 0.279 | 0.186 |
| -2.11750000000004 | 0.556 | 0.278 | 0.185 |
| -2.11500000000004 | 0.553 | 0.277 | 0.184 |
| -2.11250000000004 | 0.55 | 0.275 | 0.183 |
| -2.11000000000004 | 0.547 | 0.274 | 0.182 |
| -2.10750000000004 | 0.545 | 0.272 | 0.182 |
| -2.10500000000004 | 0.542 | 0.271 | 0.181 |
| -2.10250000000004 | 0.539 | 0.269 | 0.18 |
| -2.10000000000004 | 0.536 | 0.268 | 0.179 |
| -2.097500000000041 | 0.533 | 0.267 | 0.178 |
| -2.095000000000041 | 0.531 | 0.265 | 0.177 |
| -2.092500000000041 | 0.528 | 0.264 | 0.176 |
| -2.090000000000041 | 0.525 | 0.263 | 0.175 |
| -2.087500000000041 | 0.522 | 0.261 | 0.174 |
| -2.085000000000041 | 0.519 | 0.26 | 0.173 |
| -2.082500000000041 | 0.517 | 0.258 | 0.172 |
| -2.080000000000041 | 0.514 | 0.257 | 0.171 |
| -2.077500000000041 | 0.511 | 0.256 | 0.17 |
| -2.075000000000041 | 0.509 | 0.254 | 0.17 |
| -2.072500000000041 | 0.506 | 0.253 | 0.169 |
| -2.070000000000041 | 0.503 | 0.252 | 0.168 |
| -2.067500000000041 | 0.5 | 0.25 | 0.167 |
| -2.065000000000041 | 0.498 | 0.249 | 0.166 |
| -2.062500000000041 | 0.495 | 0.248 | 0.165 |
| -2.060000000000041 | 0.492 | 0.246 | 0.164 |
| -2.057500000000041 | 0.49 | 0.245 | 0.163 |
| -2.055000000000041 | 0.487 | 0.244 | 0.162 |
| -2.052500000000042 | 0.484 | 0.242 | 0.161 |
| -2.050000000000042 | 0.482 | 0.241 | 0.161 |
| -2.047500000000042 | 0.479 | 0.24 | 0.16 |
| -2.045000000000042 | 0.476 | 0.238 | 0.159 |
| -2.042500000000042 | 0.474 | 0.237 | 0.158 |
| -2.040000000000042 | 0.471 | 0.236 | 0.157 |
| -2.037500000000042 | 0.469 | 0.234 | 0.156 |
| -2.035000000000042 | 0.466 | 0.233 | 0.155 |
| -2.032500000000042 | 0.463 | 0.232 | 0.154 |
| -2.030000000000042 | 0.461 | 0.23 | 0.154 |
| -2.027500000000042 | 0.458 | 0.229 | 0.153 |
| -2.025000000000042 | 0.456 | 0.228 | 0.152 |
| -2.022500000000042 | 0.453 | 0.227 | 0.151 |
| -2.020000000000042 | 0.451 | 0.225 | 0.15 |
| -2.017500000000042 | 0.448 | 0.224 | 0.149 |
| -2.015000000000042 | 0.446 | 0.223 | 0.149 |
| -2.012500000000042 | 0.443 | 0.221 | 0.148 |
| -2.010000000000042 | 0.44 | 0.22 | 0.147 |
| -2.007500000000042 | 0.438 | 0.219 | 0.146 |
| -2.005000000000043 | 0.435 | 0.218 | 0.145 |
| -2.002500000000043 | 0.433 | 0.216 | 0.144 |
| -2.000000000000043 | 0.43 | 0.215 | 0.143 |
| -1.997500000000043 | 0.428 | 0.214 | 0.143 |
| -1.995000000000043 | 0.425 | 0.213 | 0.142 |
| -1.992500000000043 | 0.423 | 0.211 | 0.141 |
| -1.990000000000043 | 0.42 | 0.21 | 0.14 |
| -1.987500000000043 | 0.418 | 0.209 | 0.139 |
| -1.985000000000043 | 0.416 | 0.208 | 0.139 |
| -1.982500000000043 | 0.413 | 0.207 | 0.138 |
| -1.980000000000043 | 0.411 | 0.205 | 0.137 |
| -1.977500000000043 | 0.408 | 0.204 | 0.136 |
| -1.975000000000043 | 0.406 | 0.203 | 0.135 |
| -1.972500000000043 | 0.403 | 0.202 | 0.134 |
| -1.970000000000043 | 0.401 | 0.2 | 0.134 |
| -1.967500000000043 | 0.398 | 0.199 | 0.133 |
| -1.965000000000043 | 0.396 | 0.198 | 0.132 |
| -1.962500000000043 | 0.394 | 0.197 | 0.131 |
| -1.960000000000043 | 0.391 | 0.196 | 0.13 |
| -1.957500000000044 | 0.389 | 0.194 | 0.13 |
| -1.955000000000044 | 0.386 | 0.193 | 0.129 |
| -1.952500000000044 | 0.384 | 0.192 | 0.128 |
| -1.950000000000044 | 0.382 | 0.191 | 0.127 |
| -1.947500000000044 | 0.379 | 0.19 | 0.126 |
| -1.945000000000044 | 0.377 | 0.188 | 0.126 |
| -1.942500000000044 | 0.374 | 0.187 | 0.125 |
| -1.940000000000044 | 0.372 | 0.186 | 0.124 |
| -1.937500000000044 | 0.37 | 0.185 | 0.123 |
| -1.935000000000044 | 0.367 | 0.184 | 0.122 |
| -1.932500000000044 | 0.365 | 0.182 | 0.122 |
| -1.930000000000044 | 0.363 | 0.181 | 0.121 |
| -1.927500000000044 | 0.36 | 0.18 | 0.12 |
| -1.925000000000044 | 0.358 | 0.179 | 0.119 |
| -1.922500000000044 | 0.356 | 0.178 | 0.119 |
| -1.920000000000044 | 0.353 | 0.177 | 0.118 |
| -1.917500000000044 | 0.351 | 0.175 | 0.117 |
| -1.915000000000044 | 0.349 | 0.174 | 0.116 |
| -1.912500000000044 | 0.346 | 0.173 | 0.115 |
| -1.910000000000045 | 0.344 | 0.172 | 0.115 |
| -1.907500000000045 | 0.342 | 0.171 | 0.114 |
| -1.905000000000045 | 0.339 | 0.17 | 0.113 |
| -1.902500000000045 | 0.337 | 0.169 | 0.112 |
| -1.900000000000045 | 0.335 | 0.167 | 0.112 |
| -1.897500000000045 | 0.333 | 0.166 | 0.111 |
| -1.895000000000045 | 0.33 | 0.165 | 0.11 |
| -1.892500000000045 | 0.328 | 0.164 | 0.109 |
| -1.890000000000045 | 0.326 | 0.163 | 0.109 |
| -1.887500000000045 | 0.323 | 0.162 | 0.108 |
| -1.885000000000045 | 0.321 | 0.161 | 0.107 |
| -1.882500000000045 | 0.319 | 0.159 | 0.106 |
| -1.880000000000045 | 0.317 | 0.158 | 0.106 |
| -1.877500000000045 | 0.314 | 0.157 | 0.105 |
| -1.875000000000045 | 0.312 | 0.156 | 0.104 |
| -1.872500000000045 | 0.31 | 0.155 | 0.103 |
| -1.870000000000045 | 0.308 | 0.154 | 0.103 |
| -1.867500000000045 | 0.305 | 0.153 | 0.102 |
| -1.865000000000045 | 0.303 | 0.152 | 0.101 |
| -1.862500000000046 | 0.301 | 0.15 | 0.1 |
| -1.860000000000046 | 0.299 | 0.149 | 0.1 |
| -1.857500000000046 | 0.296 | 0.148 | 0.099 |
| -1.855000000000046 | 0.294 | 0.147 | 0.098 |
| -1.852500000000046 | 0.292 | 0.146 | 0.097 |
| -1.850000000000046 | 0.29 | 0.145 | 0.097 |
| -1.847500000000046 | 0.288 | 0.144 | 0.096 |
| -1.845000000000046 | 0.285 | 0.143 | 0.095 |
| -1.842500000000046 | 0.283 | 0.142 | 0.094 |
| -1.840000000000046 | 0.281 | 0.14 | 0.094 |
| -1.837500000000046 | 0.279 | 0.139 | 0.093 |
| -1.835000000000046 | 0.276 | 0.138 | 0.092 |
| -1.832500000000046 | 0.274 | 0.137 | 0.091 |
| -1.830000000000046 | 0.272 | 0.136 | 0.091 |
| -1.827500000000046 | 0.27 | 0.135 | 0.09 |
| -1.825000000000046 | 0.268 | 0.134 | 0.089 |
| -1.822500000000046 | 0.266 | 0.133 | 0.089 |
| -1.820000000000046 | 0.263 | 0.132 | 0.088 |
| -1.817500000000046 | 0.261 | 0.131 | 0.087 |
| -1.815000000000047 | 0.259 | 0.13 | 0.086 |
| -1.812500000000047 | 0.257 | 0.128 | 0.086 |
| -1.810000000000047 | 0.255 | 0.127 | 0.085 |
| -1.807500000000047 | 0.253 | 0.126 | 0.084 |
| -1.805000000000047 | 0.25 | 0.125 | 0.083 |
| -1.802500000000047 | 0.248 | 0.124 | 0.083 |
| -1.800000000000047 | 0.246 | 0.123 | 0.082 |
| -1.797500000000047 | 0.244 | 0.122 | 0.081 |
| -1.795000000000047 | 0.242 | 0.121 | 0.081 |
| -1.792500000000047 | 0.24 | 0.12 | 0.08 |
| -1.790000000000047 | 0.237 | 0.119 | 0.079 |
| -1.787500000000047 | 0.235 | 0.118 | 0.078 |
| -1.785000000000047 | 0.233 | 0.117 | 0.078 |
| -1.782500000000047 | 0.231 | 0.116 | 0.077 |
| -1.780000000000047 | 0.229 | 0.114 | 0.076 |
| -1.777500000000047 | 0.227 | 0.113 | 0.076 |
| -1.775000000000047 | 0.225 | 0.112 | 0.075 |
| -1.772500000000047 | 0.222 | 0.111 | 0.074 |
| -1.770000000000047 | 0.22 | 0.11 | 0.073 |
| -1.767500000000048 | 0.218 | 0.109 | 0.073 |
| -1.765000000000048 | 0.216 | 0.108 | 0.072 |
| -1.762500000000048 | 0.214 | 0.107 | 0.071 |
| -1.760000000000048 | 0.212 | 0.106 | 0.071 |
| -1.757500000000048 | 0.21 | 0.105 | 0.07 |
| -1.755000000000048 | 0.208 | 0.104 | 0.069 |
| -1.752500000000048 | 0.206 | 0.103 | 0.069 |
| -1.750000000000048 | 0.203 | 0.102 | 0.068 |
| -1.747500000000048 | 0.201 | 0.101 | 0.067 |
| -1.745000000000048 | 0.199 | 0.1 | 0.066 |
| -1.742500000000048 | 0.197 | 0.099 | 0.066 |
| -1.740000000000048 | 0.195 | 0.098 | 0.065 |
| -1.737500000000048 | 0.193 | 0.096 | 0.064 |
| -1.735000000000048 | 0.191 | 0.095 | 0.064 |
| -1.732500000000048 | 0.189 | 0.094 | 0.063 |
| -1.730000000000048 | 0.187 | 0.093 | 0.062 |
| -1.727500000000048 | 0.185 | 0.092 | 0.062 |
| -1.725000000000048 | 0.182 | 0.091 | 0.061 |
| -1.722500000000048 | 0.18 | 0.09 | 0.06 |
| -1.720000000000049 | 0.178 | 0.089 | 0.059 |
| -1.717500000000049 | 0.176 | 0.088 | 0.059 |
| -1.715000000000049 | 0.174 | 0.087 | 0.058 |
| -1.712500000000049 | 0.172 | 0.086 | 0.057 |
| -1.710000000000049 | 0.17 | 0.085 | 0.057 |
| -1.707500000000049 | 0.168 | 0.084 | 0.056 |
| -1.705000000000049 | 0.166 | 0.083 | 0.055 |
| -1.702500000000049 | 0.164 | 0.082 | 0.055 |
| -1.700000000000049 | 0.162 | 0.081 | 0.054 |
| -1.697500000000049 | 0.16 | 0.08 | 0.053 |
| -1.69500000000005 | 0.158 | 0.079 | 0.053 |
| -1.69250000000005 | 0.156 | 0.078 | 0.052 |
| -1.69000000000005 | 0.153 | 0.077 | 0.051 |
| -1.687500000000049 | 0.151 | 0.076 | 0.05 |
| -1.685000000000049 | 0.149 | 0.075 | 0.05 |
| -1.682500000000049 | 0.147 | 0.074 | 0.049 |
| -1.680000000000049 | 0.145 | 0.073 | 0.048 |
| -1.677500000000049 | 0.143 | 0.072 | 0.048 |
| -1.675000000000049 | 0.141 | 0.071 | 0.047 |
| -1.67250000000005 | 0.139 | 0.07 | 0.046 |
| -1.67000000000005 | 0.137 | 0.069 | 0.046 |
| -1.66750000000005 | 0.135 | 0.068 | 0.045 |
| -1.66500000000005 | 0.133 | 0.066 | 0.044 |
| -1.66250000000005 | 0.131 | 0.065 | 0.044 |
| -1.66000000000005 | 0.129 | 0.064 | 0.043 |
| -1.65750000000005 | 0.127 | 0.063 | 0.042 |
| -1.65500000000005 | 0.125 | 0.062 | 0.042 |
| -1.65250000000005 | 0.123 | 0.061 | 0.041 |
| -1.65000000000005 | 0.121 | 0.06 | 0.04 |
| -1.64750000000005 | 0.119 | 0.059 | 0.04 |
| -1.64500000000005 | 0.117 | 0.058 | 0.039 |
| -1.64250000000005 | 0.115 | 0.057 | 0.038 |
| -1.64000000000005 | 0.113 | 0.056 | 0.038 |
| -1.63750000000005 | 0.111 | 0.055 | 0.037 |
| -1.63500000000005 | 0.109 | 0.054 | 0.036 |
| -1.63250000000005 | 0.107 | 0.053 | 0.036 |
| -1.63000000000005 | 0.104 | 0.052 | 0.035 |
| -1.62750000000005 | 0.102 | 0.051 | 0.034 |
| -1.625000000000051 | 0.1 | 0.05 | 0.033 |
| -1.622500000000051 | 0.098 | 0.049 | 0.033 |
| -1.620000000000051 | 0.096 | 0.048 | 0.032 |
| -1.617500000000051 | 0.094 | 0.047 | 0.031 |
| -1.615000000000051 | 0.092 | 0.046 | 0.031 |
| -1.612500000000051 | 0.09 | 0.045 | 0.03 |
| -1.610000000000051 | 0.088 | 0.044 | 0.029 |
| -1.607500000000051 | 0.086 | 0.043 | 0.029 |
| -1.605000000000051 | 0.084 | 0.042 | 0.028 |
| -1.602500000000051 | 0.082 | 0.041 | 0.027 |
| -1.600000000000051 | 0.08 | 0.04 | 0.027 |
| -1.597500000000051 | 0.078 | 0.039 | 0.026 |
| -1.595000000000051 | 0.076 | 0.038 | 0.025 |
| -1.592500000000051 | 0.074 | 0.037 | 0.025 |
| -1.590000000000051 | 0.072 | 0.036 | 0.024 |
| -1.587500000000051 | 0.07 | 0.035 | 0.023 |
| -1.585000000000051 | 0.068 | 0.034 | 0.023 |
| -1.582500000000052 | 0.066 | 0.033 | 0.022 |
| -1.580000000000052 | 0.064 | 0.032 | 0.021 |
| -1.577500000000052 | 0.062 | 0.031 | 0.021 |
| -1.575000000000052 | 0.06 | 0.03 | 0.02 |
| -1.572500000000052 | 0.058 | 0.029 | 0.019 |
| -1.570000000000052 | 0.056 | 0.028 | 0.019 |
| -1.567500000000052 | 0.054 | 0.027 | 0.018 |
| -1.565000000000052 | 0.052 | 0.026 | 0.017 |
| -1.562500000000052 | 0.05 | 0.025 | 0.017 |
| -1.560000000000052 | 0.048 | 0.024 | 0.016 |
| -1.557500000000052 | 0.046 | 0.023 | 0.015 |
| -1.555000000000052 | 0.044 | 0.022 | 0.015 |
| -1.552500000000052 | 0.042 | 0.021 | 0.014 |
| -1.550000000000052 | 0.04 | 0.02 | 0.013 |
| -1.547500000000052 | 0.038 | 0.019 | 0.013 |
| -1.545000000000052 | 0.036 | 0.018 | 0.012 |
| -1.542500000000052 | 0.034 | 0.017 | 0.011 |
| -1.540000000000052 | 0.032 | 0.016 | 0.011 |
| -1.537500000000052 | 0.03 | 0.015 | 0.01 |
| -1.535000000000053 | 0.028 | 0.014 | 0.009 |
| -1.532500000000053 | 0.026 | 0.013 | 0.009 |
| -1.530000000000053 | 0.024 | 0.012 | 0.008 |
| -1.527500000000053 | 0.022 | 0.011 | 0.007 |
| -1.525000000000053 | 0.02 | 0.01 | 0.007 |
| -1.522500000000053 | 0.018 | 0.009 | 0.006 |
| -1.520000000000053 | 0.016 | 0.008 | 0.005 |
| -1.517500000000053 | 0.014 | 0.007 | 0.005 |
| -1.515000000000053 | 0.012 | 0.006 | 0.004 |
| -1.512500000000053 | 0.01 | 0.005 | 0.003 |
| -1.510000000000053 | 0.008 | 0.004 | 0.003 |
| -1.507500000000053 | 0.006 | 0.003 | 0.002 |
| -1.505000000000053 | 0.004 | 0.002 | 0.001 |
| -1.502500000000053 | 0.002 | 0.001 | 0.001 |
| -1.500000000000053 | 0 | 0 | 0 |
| -1.497500000000053 | -0.002 | -0.001 | -0.001 |
| -1.495000000000053 | -0.004 | -0.002 | -0.001 |
| -1.492500000000053 | -0.006 | -0.003 | -0.002 |
| -1.490000000000053 | -0.008 | -0.004 | -0.003 |
| -1.487500000000054 | -0.01 | -0.005 | -0.003 |
| -1.485000000000054 | -0.012 | -0.006 | -0.004 |
| -1.482500000000054 | -0.014 | -0.007 | -0.005 |
| -1.480000000000054 | -0.016 | -0.008 | -0.005 |
| -1.477500000000054 | -0.018 | -0.009 | -0.006 |
| -1.475000000000054 | -0.02 | -0.01 | -0.007 |
| -1.472500000000054 | -0.022 | -0.011 | -0.007 |
| -1.470000000000054 | -0.024 | -0.012 | -0.008 |
| -1.467500000000054 | -0.026 | -0.013 | -0.009 |
| -1.465000000000054 | -0.028 | -0.014 | -0.009 |
| -1.462500000000054 | -0.03 | -0.015 | -0.01 |
| -1.460000000000054 | -0.032 | -0.016 | -0.011 |
| -1.457500000000054 | -0.034 | -0.017 | -0.011 |
| -1.455000000000054 | -0.036 | -0.018 | -0.012 |
| -1.452500000000054 | -0.038 | -0.019 | -0.013 |
| -1.450000000000054 | -0.04 | -0.02 | -0.013 |
| -1.447500000000054 | -0.042 | -0.021 | -0.014 |
| -1.445000000000054 | -0.044 | -0.022 | -0.015 |
| -1.442500000000054 | -0.046 | -0.023 | -0.015 |
| -1.440000000000055 | -0.048 | -0.024 | -0.016 |
| -1.437500000000055 | -0.05 | -0.025 | -0.017 |
| -1.435000000000055 | -0.052 | -0.026 | -0.017 |
| -1.432500000000055 | -0.054 | -0.027 | -0.018 |
| -1.430000000000055 | -0.056 | -0.028 | -0.019 |
| -1.427500000000055 | -0.058 | -0.029 | -0.019 |
| -1.425000000000055 | -0.06 | -0.03 | -0.02 |
| -1.422500000000055 | -0.062 | -0.031 | -0.021 |
| -1.420000000000055 | -0.064 | -0.032 | -0.021 |
| -1.417500000000055 | -0.066 | -0.033 | -0.022 |
| -1.415000000000055 | -0.068 | -0.034 | -0.023 |
| -1.412500000000055 | -0.07 | -0.035 | -0.023 |
| -1.410000000000055 | -0.072 | -0.036 | -0.024 |
| -1.407500000000055 | -0.074 | -0.037 | -0.025 |
| -1.405000000000055 | -0.076 | -0.038 | -0.025 |
| -1.402500000000055 | -0.078 | -0.039 | -0.026 |
| -1.400000000000055 | -0.08 | -0.04 | -0.027 |
| -1.397500000000055 | -0.082 | -0.041 | -0.027 |
| -1.395000000000055 | -0.084 | -0.042 | -0.028 |
| -1.392500000000056 | -0.086 | -0.043 | -0.029 |
| -1.390000000000056 | -0.088 | -0.044 | -0.029 |
| -1.387500000000056 | -0.09 | -0.045 | -0.03 |
| -1.385000000000056 | -0.092 | -0.046 | -0.031 |
| -1.382500000000056 | -0.094 | -0.047 | -0.031 |
| -1.380000000000056 | -0.096 | -0.048 | -0.032 |
| -1.377500000000056 | -0.098 | -0.049 | -0.033 |
| -1.375000000000056 | -0.1 | -0.05 | -0.033 |
| -1.372500000000056 | -0.102 | -0.051 | -0.034 |
| -1.370000000000056 | -0.104 | -0.052 | -0.035 |
| -1.367500000000056 | -0.107 | -0.053 | -0.036 |
| -1.365000000000056 | -0.109 | -0.054 | -0.036 |
| -1.362500000000056 | -0.111 | -0.055 | -0.037 |
| -1.360000000000056 | -0.113 | -0.056 | -0.038 |
| -1.357500000000056 | -0.115 | -0.057 | -0.038 |
| -1.355000000000056 | -0.117 | -0.058 | -0.039 |
| -1.352500000000056 | -0.119 | -0.059 | -0.04 |
| -1.350000000000056 | -0.121 | -0.06 | -0.04 |
| -1.347500000000056 | -0.123 | -0.061 | -0.041 |
| -1.345000000000057 | -0.125 | -0.062 | -0.042 |
| -1.342500000000057 | -0.127 | -0.063 | -0.042 |
| -1.340000000000057 | -0.129 | -0.064 | -0.043 |
| -1.337500000000057 | -0.131 | -0.065 | -0.044 |
| -1.335000000000057 | -0.133 | -0.066 | -0.044 |
| -1.332500000000057 | -0.135 | -0.068 | -0.045 |
| -1.330000000000057 | -0.137 | -0.069 | -0.046 |
| -1.327500000000057 | -0.139 | -0.07 | -0.046 |
| -1.325000000000057 | -0.141 | -0.071 | -0.047 |
| -1.322500000000057 | -0.143 | -0.072 | -0.048 |
| -1.320000000000057 | -0.145 | -0.073 | -0.048 |
| -1.317500000000057 | -0.147 | -0.074 | -0.049 |
| -1.315000000000057 | -0.149 | -0.075 | -0.05 |
| -1.312500000000057 | -0.151 | -0.076 | -0.05 |
| -1.310000000000057 | -0.153 | -0.077 | -0.051 |
| -1.307500000000057 | -0.156 | -0.078 | -0.052 |
| -1.305000000000057 | -0.158 | -0.079 | -0.053 |
| -1.302500000000057 | -0.16 | -0.08 | -0.053 |
| -1.300000000000058 | -0.162 | -0.081 | -0.054 |
| -1.297500000000058 | -0.164 | -0.082 | -0.055 |
| -1.295000000000058 | -0.166 | -0.083 | -0.055 |
| -1.292500000000058 | -0.168 | -0.084 | -0.056 |
| -1.290000000000058 | -0.17 | -0.085 | -0.057 |
| -1.287500000000058 | -0.172 | -0.086 | -0.057 |
| -1.285000000000058 | -0.174 | -0.087 | -0.058 |
| -1.282500000000058 | -0.176 | -0.088 | -0.059 |
| -1.280000000000058 | -0.178 | -0.089 | -0.059 |
| -1.277500000000058 | -0.18 | -0.09 | -0.06 |
| -1.275000000000058 | -0.182 | -0.091 | -0.061 |
| -1.272500000000058 | -0.185 | -0.092 | -0.062 |
| -1.270000000000058 | -0.187 | -0.093 | -0.062 |
| -1.267500000000058 | -0.189 | -0.094 | -0.063 |
| -1.265000000000058 | -0.191 | -0.095 | -0.064 |
| -1.262500000000058 | -0.193 | -0.096 | -0.064 |
| -1.260000000000058 | -0.195 | -0.098 | -0.065 |
| -1.257500000000058 | -0.197 | -0.099 | -0.066 |
| -1.255000000000058 | -0.199 | -0.1 | -0.066 |
| -1.252500000000059 | -0.201 | -0.101 | -0.067 |
| -1.250000000000059 | -0.203 | -0.102 | -0.068 |
| -1.247500000000059 | -0.206 | -0.103 | -0.069 |
| -1.245000000000059 | -0.208 | -0.104 | -0.069 |
| -1.242500000000059 | -0.21 | -0.105 | -0.07 |
| -1.240000000000059 | -0.212 | -0.106 | -0.071 |
| -1.237500000000059 | -0.214 | -0.107 | -0.071 |
| -1.235000000000059 | -0.216 | -0.108 | -0.072 |
| -1.232500000000059 | -0.218 | -0.109 | -0.073 |
| -1.23000000000006 | -0.22 | -0.11 | -0.073 |
| -1.227500000000059 | -0.222 | -0.111 | -0.074 |
| -1.225000000000059 | -0.225 | -0.112 | -0.075 |
| -1.222500000000059 | -0.227 | -0.113 | -0.076 |
| -1.220000000000059 | -0.229 | -0.114 | -0.076 |
| -1.217500000000059 | -0.231 | -0.116 | -0.077 |
| -1.215000000000059 | -0.233 | -0.117 | -0.078 |
| -1.212500000000059 | -0.235 | -0.118 | -0.078 |
| -1.210000000000059 | -0.237 | -0.119 | -0.079 |
| -1.20750000000006 | -0.24 | -0.12 | -0.08 |
| -1.20500000000006 | -0.242 | -0.121 | -0.081 |
| -1.20250000000006 | -0.244 | -0.122 | -0.081 |
| -1.20000000000006 | -0.246 | -0.123 | -0.082 |
| -1.19750000000006 | -0.248 | -0.124 | -0.083 |
| -1.19500000000006 | -0.25 | -0.125 | -0.083 |
| -1.19250000000006 | -0.253 | -0.126 | -0.084 |
| -1.19000000000006 | -0.255 | -0.127 | -0.085 |
| -1.18750000000006 | -0.257 | -0.128 | -0.086 |
| -1.18500000000006 | -0.259 | -0.13 | -0.086 |
| -1.18250000000006 | -0.261 | -0.131 | -0.087 |
| -1.18000000000006 | -0.263 | -0.132 | -0.088 |
| -1.17750000000006 | -0.266 | -0.133 | -0.089 |
| -1.17500000000006 | -0.268 | -0.134 | -0.089 |
| -1.17250000000006 | -0.27 | -0.135 | -0.09 |
| -1.17000000000006 | -0.272 | -0.136 | -0.091 |
| -1.16750000000006 | -0.274 | -0.137 | -0.091 |
| -1.16500000000006 | -0.276 | -0.138 | -0.092 |
| -1.16250000000006 | -0.279 | -0.139 | -0.093 |
| -1.160000000000061 | -0.281 | -0.14 | -0.094 |
| -1.157500000000061 | -0.283 | -0.142 | -0.094 |
| -1.155000000000061 | -0.285 | -0.143 | -0.095 |
| -1.152500000000061 | -0.288 | -0.144 | -0.096 |
| -1.150000000000061 | -0.29 | -0.145 | -0.097 |
| -1.147500000000061 | -0.292 | -0.146 | -0.097 |
| -1.145000000000061 | -0.294 | -0.147 | -0.098 |
| -1.142500000000061 | -0.296 | -0.148 | -0.099 |
| -1.140000000000061 | -0.299 | -0.149 | -0.1 |
| -1.137500000000061 | -0.301 | -0.15 | -0.1 |
| -1.135000000000061 | -0.303 | -0.152 | -0.101 |
| -1.132500000000061 | -0.305 | -0.153 | -0.102 |
| -1.130000000000061 | -0.308 | -0.154 | -0.103 |
| -1.127500000000061 | -0.31 | -0.155 | -0.103 |
| -1.125000000000061 | -0.312 | -0.156 | -0.104 |
| -1.122500000000061 | -0.314 | -0.157 | -0.105 |
| -1.120000000000061 | -0.317 | -0.158 | -0.106 |
| -1.117500000000061 | -0.319 | -0.159 | -0.106 |
| -1.115000000000061 | -0.321 | -0.161 | -0.107 |
| -1.112500000000062 | -0.323 | -0.162 | -0.108 |
| -1.110000000000062 | -0.326 | -0.163 | -0.109 |
| -1.107500000000062 | -0.328 | -0.164 | -0.109 |
| -1.105000000000062 | -0.33 | -0.165 | -0.11 |
| -1.102500000000062 | -0.333 | -0.166 | -0.111 |
| -1.100000000000062 | -0.335 | -0.167 | -0.112 |
| -1.097500000000062 | -0.337 | -0.169 | -0.112 |
| -1.095000000000062 | -0.339 | -0.17 | -0.113 |
| -1.092500000000062 | -0.342 | -0.171 | -0.114 |
| -1.090000000000062 | -0.344 | -0.172 | -0.115 |
| -1.087500000000062 | -0.346 | -0.173 | -0.115 |
| -1.085000000000062 | -0.349 | -0.174 | -0.116 |
| -1.082500000000062 | -0.351 | -0.175 | -0.117 |
| -1.080000000000062 | -0.353 | -0.177 | -0.118 |
| -1.077500000000062 | -0.356 | -0.178 | -0.119 |
| -1.075000000000062 | -0.358 | -0.179 | -0.119 |
| -1.072500000000062 | -0.36 | -0.18 | -0.12 |
| -1.070000000000062 | -0.363 | -0.181 | -0.121 |
| -1.067500000000062 | -0.365 | -0.182 | -0.122 |
| -1.065000000000063 | -0.367 | -0.184 | -0.122 |
| -1.062500000000063 | -0.37 | -0.185 | -0.123 |
| -1.060000000000063 | -0.372 | -0.186 | -0.124 |
| -1.057500000000063 | -0.374 | -0.187 | -0.125 |
| -1.055000000000063 | -0.377 | -0.188 | -0.126 |
| -1.052500000000063 | -0.379 | -0.19 | -0.126 |
| -1.050000000000063 | -0.382 | -0.191 | -0.127 |
| -1.047500000000063 | -0.384 | -0.192 | -0.128 |
| -1.045000000000063 | -0.386 | -0.193 | -0.129 |
| -1.042500000000063 | -0.389 | -0.194 | -0.13 |
| -1.040000000000063 | -0.391 | -0.196 | -0.13 |
| -1.037500000000063 | -0.394 | -0.197 | -0.131 |
| -1.035000000000063 | -0.396 | -0.198 | -0.132 |
| -1.032500000000063 | -0.398 | -0.199 | -0.133 |
| -1.030000000000063 | -0.401 | -0.2 | -0.134 |
| -1.027500000000063 | -0.403 | -0.202 | -0.134 |
| -1.025000000000063 | -0.406 | -0.203 | -0.135 |
| -1.022500000000063 | -0.408 | -0.204 | -0.136 |
| -1.020000000000064 | -0.411 | -0.205 | -0.137 |
| -1.017500000000064 | -0.413 | -0.207 | -0.138 |
| -1.015000000000064 | -0.416 | -0.208 | -0.139 |
| -1.012500000000064 | -0.418 | -0.209 | -0.139 |
| -1.010000000000064 | -0.42 | -0.21 | -0.14 |
| -1.007500000000064 | -0.423 | -0.211 | -0.141 |
| -1.005000000000064 | -0.425 | -0.213 | -0.142 |
| -1.002500000000064 | -0.428 | -0.214 | -0.143 |
| -1.000000000000064 | -0.43 | -0.215 | -0.143 |
| -0.997500000000064 | -0.433 | -0.216 | -0.144 |
| -0.995000000000064 | -0.435 | -0.218 | -0.145 |
| -0.992500000000064 | -0.438 | -0.219 | -0.146 |
| -0.990000000000064 | -0.44 | -0.22 | -0.147 |
| -0.987500000000064 | -0.443 | -0.221 | -0.148 |
| -0.985000000000064 | -0.446 | -0.223 | -0.149 |
| -0.982500000000064 | -0.448 | -0.224 | -0.149 |
| -0.980000000000064 | -0.451 | -0.225 | -0.15 |
| -0.977500000000064 | -0.453 | -0.227 | -0.151 |
| -0.975000000000064 | -0.456 | -0.228 | -0.152 |
| -0.972500000000065 | -0.458 | -0.229 | -0.153 |
| -0.970000000000065 | -0.461 | -0.23 | -0.154 |
| -0.967500000000065 | -0.463 | -0.232 | -0.154 |
| -0.965000000000065 | -0.466 | -0.233 | -0.155 |
| -0.962500000000065 | -0.469 | -0.234 | -0.156 |
| -0.960000000000065 | -0.471 | -0.236 | -0.157 |
| -0.957500000000065 | -0.474 | -0.237 | -0.158 |
| -0.955000000000065 | -0.476 | -0.238 | -0.159 |
| -0.952500000000065 | -0.479 | -0.24 | -0.16 |
| -0.950000000000065 | -0.482 | -0.241 | -0.161 |
| -0.947500000000065 | -0.484 | -0.242 | -0.161 |
| -0.945000000000065 | -0.487 | -0.244 | -0.162 |
| -0.942500000000065 | -0.49 | -0.245 | -0.163 |
| -0.940000000000065 | -0.492 | -0.246 | -0.164 |
| -0.937500000000065 | -0.495 | -0.248 | -0.165 |
| -0.935000000000065 | -0.498 | -0.249 | -0.166 |
| -0.932500000000065 | -0.5 | -0.25 | -0.167 |
| -0.930000000000065 | -0.503 | -0.252 | -0.168 |
| -0.927500000000065 | -0.506 | -0.253 | -0.169 |
| -0.925000000000066 | -0.509 | -0.254 | -0.17 |
| -0.922500000000066 | -0.511 | -0.256 | -0.17 |
| -0.920000000000066 | -0.514 | -0.257 | -0.171 |
| -0.917500000000066 | -0.517 | -0.258 | -0.172 |
| -0.915000000000066 | -0.519 | -0.26 | -0.173 |
| -0.912500000000066 | -0.522 | -0.261 | -0.174 |
| -0.910000000000066 | -0.525 | -0.263 | -0.175 |
| -0.907500000000066 | -0.528 | -0.264 | -0.176 |
| -0.905000000000066 | -0.531 | -0.265 | -0.177 |
| -0.902500000000066 | -0.533 | -0.267 | -0.178 |
| -0.900000000000066 | -0.536 | -0.268 | -0.179 |
| -0.897500000000066 | -0.539 | -0.269 | -0.18 |
| -0.895000000000066 | -0.542 | -0.271 | -0.181 |
| -0.892500000000066 | -0.545 | -0.272 | -0.182 |
| -0.890000000000066 | -0.547 | -0.274 | -0.182 |
| -0.887500000000066 | -0.55 | -0.275 | -0.183 |
| -0.885000000000066 | -0.553 | -0.277 | -0.184 |
| -0.882500000000066 | -0.556 | -0.278 | -0.185 |
| -0.880000000000066 | -0.559 | -0.279 | -0.186 |
| -0.877500000000067 | -0.562 | -0.281 | -0.187 |
| -0.875000000000067 | -0.565 | -0.282 | -0.188 |
| -0.872500000000067 | -0.568 | -0.284 | -0.189 |
| -0.870000000000067 | -0.571 | -0.285 | -0.19 |
| -0.867500000000067 | -0.574 | -0.287 | -0.191 |
| -0.865000000000067 | -0.576 | -0.288 | -0.192 |
| -0.862500000000067 | -0.579 | -0.29 | -0.193 |
| -0.860000000000067 | -0.582 | -0.291 | -0.194 |
| -0.857500000000067 | -0.585 | -0.293 | -0.195 |
| -0.855000000000067 | -0.588 | -0.294 | -0.196 |
| -0.852500000000067 | -0.591 | -0.296 | -0.197 |
| -0.850000000000067 | -0.594 | -0.297 | -0.198 |
| -0.847500000000067 | -0.597 | -0.299 | -0.199 |
| -0.845000000000067 | -0.6 | -0.3 | -0.2 |
| -0.842500000000067 | -0.604 | -0.302 | -0.201 |
| -0.840000000000067 | -0.607 | -0.303 | -0.202 |
| -0.837500000000067 | -0.61 | -0.305 | -0.203 |
| -0.835000000000067 | -0.613 | -0.306 | -0.204 |
| -0.832500000000067 | -0.616 | -0.308 | -0.205 |
| -0.830000000000068 | -0.619 | -0.309 | -0.206 |
| -0.827500000000068 | -0.622 | -0.311 | -0.207 |
| -0.825000000000068 | -0.625 | -0.313 | -0.208 |
| -0.822500000000068 | -0.628 | -0.314 | -0.209 |
| -0.820000000000068 | -0.632 | -0.316 | -0.211 |
| -0.817500000000068 | -0.635 | -0.317 | -0.212 |
| -0.815000000000068 | -0.638 | -0.319 | -0.213 |
| -0.812500000000068 | -0.641 | -0.321 | -0.214 |
| -0.810000000000068 | -0.644 | -0.322 | -0.215 |
| -0.807500000000068 | -0.648 | -0.324 | -0.216 |
| -0.805000000000068 | -0.651 | -0.325 | -0.217 |
| -0.802500000000068 | -0.654 | -0.327 | -0.218 |
| -0.800000000000068 | -0.657 | -0.329 | -0.219 |
| -0.797500000000068 | -0.661 | -0.33 | -0.22 |
| -0.795000000000068 | -0.664 | -0.332 | -0.221 |
| -0.792500000000068 | -0.667 | -0.334 | -0.222 |
| -0.790000000000068 | -0.671 | -0.335 | -0.224 |
| -0.787500000000068 | -0.674 | -0.337 | -0.225 |
| -0.785000000000068 | -0.677 | -0.339 | -0.226 |
| -0.782500000000069 | -0.681 | -0.34 | -0.227 |
| -0.780000000000069 | -0.684 | -0.342 | -0.228 |
| -0.777500000000069 | -0.688 | -0.344 | -0.229 |
| -0.775000000000069 | -0.691 | -0.346 | -0.23 |
| -0.772500000000069 | -0.695 | -0.347 | -0.232 |
| -0.770000000000069 | -0.698 | -0.349 | -0.233 |
| -0.767500000000069 | -0.701 | -0.351 | -0.234 |
| -0.765000000000069 | -0.705 | -0.353 | -0.235 |
| -0.762500000000069 | -0.709 | -0.354 | -0.236 |
| -0.760000000000069 | -0.712 | -0.356 | -0.237 |
| -0.757500000000069 | -0.716 | -0.358 | -0.239 |
| -0.755000000000069 | -0.719 | -0.36 | -0.24 |
| -0.752500000000069 | -0.723 | -0.361 | -0.241 |
| -0.750000000000069 | -0.726 | -0.363 | -0.242 |
| -0.747500000000069 | -0.73 | -0.365 | -0.243 |
| -0.745000000000069 | -0.734 | -0.367 | -0.245 |
| -0.742500000000069 | -0.737 | -0.369 | -0.246 |
| -0.740000000000069 | -0.741 | -0.371 | -0.247 |
| -0.737500000000069 | -0.745 | -0.372 | -0.248 |
| -0.73500000000007 | -0.749 | -0.374 | -0.25 |
| -0.73250000000007 | -0.752 | -0.376 | -0.251 |
| -0.73000000000007 | -0.756 | -0.378 | -0.252 |
| -0.72750000000007 | -0.76 | -0.38 | -0.253 |
| -0.72500000000007 | -0.764 | -0.382 | -0.255 |
| -0.72250000000007 | -0.768 | -0.384 | -0.256 |
| -0.72000000000007 | -0.772 | -0.386 | -0.257 |
| -0.71750000000007 | -0.776 | -0.388 | -0.259 |
| -0.71500000000007 | -0.779 | -0.39 | -0.26 |
| -0.71250000000007 | -0.783 | -0.392 | -0.261 |
| -0.71000000000007 | -0.787 | -0.394 | -0.262 |
| -0.70750000000007 | -0.791 | -0.396 | -0.264 |
| -0.70500000000007 | -0.795 | -0.398 | -0.265 |
| -0.70250000000007 | -0.8 | -0.4 | -0.267 |
| -0.70000000000007 | -0.804 | -0.402 | -0.268 |
| -0.69750000000007 | -0.808 | -0.404 | -0.269 |
| -0.69500000000007 | -0.812 | -0.406 | -0.271 |
| -0.69250000000007 | -0.816 | -0.408 | -0.272 |
| -0.69000000000007 | -0.82 | -0.41 | -0.273 |
| -0.687500000000071 | -0.824 | -0.412 | -0.275 |
| -0.685000000000071 | -0.829 | -0.414 | -0.276 |
| -0.682500000000071 | -0.833 | -0.416 | -0.278 |
| -0.680000000000071 | -0.837 | -0.419 | -0.279 |
| -0.677500000000071 | -0.842 | -0.421 | -0.281 |
| -0.675000000000071 | -0.846 | -0.423 | -0.282 |
| -0.672500000000071 | -0.85 | -0.425 | -0.283 |
| -0.670000000000071 | -0.855 | -0.427 | -0.285 |
| -0.667500000000071 | -0.859 | -0.43 | -0.286 |
| -0.665000000000071 | -0.864 | -0.432 | -0.288 |
| -0.662500000000071 | -0.868 | -0.434 | -0.289 |
| -0.660000000000071 | -0.873 | -0.436 | -0.291 |
| -0.657500000000071 | -0.878 | -0.439 | -0.293 |
| -0.655000000000071 | -0.882 | -0.441 | -0.294 |
| -0.652500000000071 | -0.887 | -0.443 | -0.296 |
| -0.650000000000071 | -0.892 | -0.446 | -0.297 |
| -0.647500000000071 | -0.896 | -0.448 | -0.299 |
| -0.645000000000071 | -0.901 | -0.451 | -0.3 |
| -0.642500000000071 | -0.906 | -0.453 | -0.302 |
| -0.640000000000072 | -0.911 | -0.455 | -0.304 |
| -0.637500000000072 | -0.916 | -0.458 | -0.305 |
| -0.635000000000072 | -0.921 | -0.46 | -0.307 |
| -0.632500000000072 | -0.926 | -0.463 | -0.309 |
| -0.630000000000072 | -0.931 | -0.465 | -0.31 |
| -0.627500000000072 | -0.936 | -0.468 | -0.312 |
| -0.625000000000072 | -0.941 | -0.471 | -0.314 |
| -0.622500000000072 | -0.946 | -0.473 | -0.315 |
| -0.620000000000072 | -0.951 | -0.476 | -0.317 |
| -0.617500000000072 | -0.957 | -0.478 | -0.319 |
| -0.615000000000072 | -0.962 | -0.481 | -0.321 |
| -0.612500000000072 | -0.967 | -0.484 | -0.322 |
| -0.610000000000072 | -0.973 | -0.486 | -0.324 |
| -0.607500000000072 | -0.978 | -0.489 | -0.326 |
| -0.605000000000072 | -0.984 | -0.492 | -0.328 |
| -0.602500000000072 | -0.989 | -0.495 | -0.33 |
| -0.600000000000072 | -0.995 | -0.498 | -0.332 |
| -0.597500000000073 | -1.001 | -0.5 | -0.334 |
| -0.595000000000073 | -1.007 | -0.503 | -0.336 |
| -0.592500000000073 | -1.012 | -0.506 | -0.337 |
| -0.590000000000073 | -1.018 | -0.509 | -0.339 |
| -0.587500000000073 | -1.024 | -0.512 | -0.341 |
| -0.585000000000073 | -1.03 | -0.515 | -0.343 |
| -0.582500000000073 | -1.036 | -0.518 | -0.345 |
| -0.580000000000073 | -1.043 | -0.521 | -0.348 |
| -0.577500000000073 | -1.049 | -0.524 | -0.35 |
| -0.575000000000073 | -1.055 | -0.528 | -0.352 |
| -0.572500000000073 | -1.061 | -0.531 | -0.354 |
| -0.570000000000073 | -1.068 | -0.534 | -0.356 |
| -0.567500000000073 | -1.074 | -0.537 | -0.358 |
| -0.565000000000073 | -1.081 | -0.541 | -0.36 |
| -0.562500000000073 | -1.088 | -0.544 | -0.363 |
| -0.560000000000073 | -1.095 | -0.547 | -0.365 |
| -0.557500000000073 | -1.101 | -0.551 | -0.367 |
| -0.555000000000073 | -1.108 | -0.554 | -0.369 |
| -0.552500000000073 | -1.115 | -0.558 | -0.372 |
| -0.550000000000074 | -1.123 | -0.561 | -0.374 |
| -0.547500000000074 | -1.13 | -0.565 | -0.377 |
| -0.545000000000074 | -1.137 | -0.569 | -0.379 |
| -0.542500000000074 | -1.145 | -0.572 | -0.382 |
| -0.540000000000074 | -1.152 | -0.576 | -0.384 |
| -0.537500000000074 | -1.16 | -0.58 | -0.387 |
| -0.535000000000074 | -1.168 | -0.584 | -0.389 |
| -0.532500000000074 | -1.176 | -0.588 | -0.392 |
| -0.530000000000074 | -1.184 | -0.592 | -0.395 |
| -0.527500000000074 | -1.192 | -0.596 | -0.397 |
| -0.525000000000074 | -1.2 | -0.6 | -0.4 |
| -0.522500000000074 | -1.208 | -0.604 | -0.403 |
| -0.520000000000074 | -1.217 | -0.608 | -0.406 |
| -0.517500000000074 | -1.226 | -0.613 | -0.409 |
| -0.515000000000074 | -1.235 | -0.617 | -0.412 |
| -0.512500000000074 | -1.244 | -0.622 | -0.415 |
| -0.510000000000074 | -1.253 | -0.626 | -0.418 |
| -0.507500000000074 | -1.262 | -0.631 | -0.421 |
| -0.505000000000074 | -1.272 | -0.636 | -0.424 |
| -0.502500000000075 | -1.281 | -0.641 | -0.427 |
| -0.500000000000075 | -1.291 | -0.646 | -0.43 |
| -0.497500000000075 | -1.301 | -0.651 | -0.434 |
| -0.495000000000075 | -1.312 | -0.656 | -0.437 |
| -0.492500000000075 | -1.322 | -0.661 | -0.441 |
| -0.490000000000075 | -1.333 | -0.666 | -0.444 |
| -0.487500000000075 | -1.344 | -0.672 | -0.448 |
| -0.485000000000075 | -1.355 | -0.678 | -0.452 |
| -0.482500000000075 | -1.367 | -0.683 | -0.456 |
| -0.480000000000075 | -1.378 | -0.689 | -0.459 |
| -0.477500000000075 | -1.391 | -0.695 | -0.464 |
| -0.475000000000075 | -1.403 | -0.701 | -0.468 |
| -0.472500000000075 | -1.416 | -0.708 | -0.472 |
| -0.470000000000075 | -1.429 | -0.714 | -0.476 |
| -0.467500000000075 | -1.442 | -0.721 | -0.481 |
| -0.465000000000075 | -1.456 | -0.728 | -0.485 |
| -0.462500000000075 | -1.47 | -0.735 | -0.49 |
| -0.460000000000075 | -1.485 | -0.742 | -0.495 |
| -0.457500000000075 | -1.5 | -0.75 | -0.5 |
| -0.455000000000075 | -1.515 | -0.758 | -0.505 |
| -0.452500000000075 | -1.531 | -0.766 | -0.51 |
| -0.450000000000075 | -1.548 | -0.774 | -0.516 |
| -0.447500000000075 | -1.565 | -0.783 | -0.522 |
| -0.445000000000075 | -1.583 | -0.792 | -0.528 |
| -0.442500000000075 | -1.602 | -0.801 | -0.534 |
| -0.440000000000075 | -1.621 | -0.811 | -0.54 |
| -0.437500000000075 | -1.641 | -0.821 | -0.547 |
| -0.435000000000075 | -1.663 | -0.831 | -0.554 |
| -0.432500000000075 | -1.685 | -0.842 | -0.562 |
| -0.430000000000075 | -1.708 | -0.854 | -0.569 |
| -0.427500000000075 | -1.732 | -0.866 | -0.577 |
| -0.425000000000075 | -1.758 | -0.879 | -0.586 |
| -0.422500000000075 | -1.785 | -0.893 | -0.595 |
| -0.420000000000075 | -1.814 | -0.907 | -0.605 |
| -0.417500000000075 | -1.845 | -0.923 | -0.615 |
| -0.415000000000075 | -1.878 | -0.939 | -0.626 |
| -0.412500000000075 | -1.914 | -0.957 | -0.638 |
| -0.410000000000075 | -1.953 | -0.976 | -0.651 |
| -0.407500000000075 | -1.995 | -0.998 | -0.665 |
| -0.405000000000074 | -2.042 | -1.021 | -0.681 |
| -0.402500000000074 | -2.093 | -1.047 | -0.698 |
| -0.400000000000074 | -2.152 | -1.076 | -0.717 |
| -0.397500000000074 | -2.219 | -1.11 | -0.74 |
| -0.395000000000074 | -2.298 | -1.149 | -0.766 |
| -0.392500000000074 | -2.394 | -1.197 | -0.798 |
| -0.390000000000074 | -2.516 | -1.258 | -0.839 |
| -0.387500000000074 | -2.683 | -1.341 | -0.894 |
| -0.385000000000074 | -2.952 | -1.476 | -0.984 |
| -0.382500000000074 | -10 | -10 | -10 |
| -0.380000000000074 | -3.147 | -1.574 | -1.049 |
| -0.377500000000074 | -2.781 | -1.39 | -0.927 |
| -0.375000000000074 | -2.582 | -1.291 | -0.861 |
| -0.372500000000074 | -2.446 | -1.223 | -0.815 |
| -0.370000000000074 | -2.341 | -1.171 | -0.78 |
| -0.367500000000074 | -2.257 | -1.129 | -0.752 |
| -0.365000000000074 | -2.186 | -1.093 | -0.729 |
| -0.362500000000074 | -2.125 | -1.063 | -0.708 |
| -0.360000000000074 | -2.072 | -1.036 | -0.691 |
| -0.357500000000074 | -2.024 | -1.012 | -0.675 |
| -0.355000000000074 | -1.981 | -0.991 | -0.66 |
| -0.352500000000074 | -1.942 | -0.971 | -0.647 |
| -0.350000000000074 | -1.906 | -0.953 | -0.635 |
| -0.347500000000074 | -1.873 | -0.936 | -0.624 |
| -0.345000000000074 | -1.842 | -0.921 | -0.614 |
| -0.342500000000074 | -1.813 | -0.907 | -0.604 |
| -0.340000000000074 | -1.786 | -0.893 | -0.595 |
| -0.337500000000074 | -1.761 | -0.88 | -0.587 |
| -0.335000000000074 | -1.737 | -0.868 | -0.579 |
| -0.332500000000074 | -1.714 | -0.857 | -0.571 |
| -0.330000000000074 | -1.693 | -0.846 | -0.564 |
| -0.327500000000074 | -1.672 | -0.836 | -0.557 |
| -0.325000000000074 | -1.653 | -0.826 | -0.551 |
| -0.322500000000074 | -1.634 | -0.817 | -0.545 |
| -0.320000000000074 | -1.616 | -0.808 | -0.539 |
| -0.317500000000074 | -1.599 | -0.799 | -0.533 |
| -0.315000000000074 | -1.582 | -0.791 | -0.527 |
| -0.312500000000074 | -1.566 | -0.783 | -0.522 |
| -0.310000000000074 | -1.551 | -0.775 | -0.517 |
| -0.307500000000074 | -1.536 | -0.768 | -0.512 |
| -0.305000000000074 | -1.522 | -0.761 | -0.507 |
| -0.302500000000074 | -1.508 | -0.754 | -0.503 |
| -0.300000000000074 | -1.495 | -0.747 | -0.498 |
| -0.297500000000074 | -1.482 | -0.741 | -0.494 |
| -0.295000000000074 | -1.469 | -0.735 | -0.49 |
| -0.292500000000074 | -1.457 | -0.728 | -0.486 |
| -0.290000000000074 | -1.445 | -0.723 | -0.482 |
| -0.287500000000074 | -1.434 | -0.717 | -0.478 |
| -0.285000000000074 | -1.422 | -0.711 | -0.474 |
| -0.282500000000074 | -1.411 | -0.706 | -0.47 |
| -0.280000000000074 | -1.401 | -0.7 | -0.467 |
| -0.277500000000074 | -1.391 | -0.695 | -0.464 |
| -0.275000000000074 | -1.38 | -0.69 | -0.46 |
| -0.272500000000074 | -1.371 | -0.685 | -0.457 |
| -0.270000000000074 | -1.361 | -0.68 | -0.454 |
| -0.267500000000074 | -1.352 | -0.676 | -0.451 |
| -0.265000000000074 | -1.342 | -0.671 | -0.447 |
| -0.262500000000074 | -1.333 | -0.667 | -0.444 |
| -0.260000000000074 | -1.325 | -0.662 | -0.442 |
| -0.257500000000074 | -1.316 | -0.658 | -0.439 |
| -0.255000000000074 | -1.308 | -0.654 | -0.436 |
| -0.252500000000074 | -1.299 | -0.65 | -0.433 |
| -0.250000000000074 | -1.291 | -0.646 | -0.43 |
| -0.247500000000074 | -1.283 | -0.642 | -0.428 |
| -0.245000000000074 | -1.276 | -0.638 | -0.425 |
| -0.242500000000074 | -1.268 | -0.634 | -0.423 |
| -0.240000000000074 | -1.26 | -0.63 | -0.42 |
| -0.237500000000074 | -1.253 | -0.627 | -0.418 |
| -0.235000000000074 | -1.246 | -0.623 | -0.415 |
| -0.232500000000074 | -1.239 | -0.619 | -0.413 |
| -0.230000000000074 | -1.232 | -0.616 | -0.411 |
| -0.227500000000074 | -1.225 | -0.613 | -0.408 |
| -0.225000000000074 | -1.218 | -0.609 | -0.406 |
| -0.222500000000074 | -1.212 | -0.606 | -0.404 |
| -0.220000000000074 | -1.205 | -0.603 | -0.402 |
| -0.217500000000074 | -1.199 | -0.599 | -0.4 |
| -0.215000000000074 | -1.193 | -0.596 | -0.398 |
| -0.212500000000074 | -1.186 | -0.593 | -0.395 |
| -0.210000000000074 | -1.18 | -0.59 | -0.393 |
| -0.207500000000074 | -1.174 | -0.587 | -0.391 |
| -0.205000000000074 | -1.168 | -0.584 | -0.389 |
| -0.202500000000074 | -1.163 | -0.581 | -0.388 |
| -0.200000000000074 | -1.157 | -0.578 | -0.386 |
| -0.197500000000074 | -1.151 | -0.576 | -0.384 |
| -0.195000000000074 | -1.146 | -0.573 | -0.382 |
| -0.192500000000074 | -1.14 | -0.57 | -0.38 |
| -0.190000000000074 | -1.135 | -0.567 | -0.378 |
| -0.187500000000074 | -1.129 | -0.565 | -0.376 |
| -0.185000000000074 | -1.124 | -0.562 | -0.375 |
| -0.182500000000074 | -1.119 | -0.56 | -0.373 |
| -0.180000000000074 | -1.114 | -0.557 | -0.371 |
| -0.177500000000074 | -1.109 | -0.554 | -0.37 |
| -0.175000000000074 | -1.104 | -0.552 | -0.368 |
| -0.172500000000074 | -1.099 | -0.55 | -0.366 |
| -0.170000000000074 | -1.094 | -0.547 | -0.365 |
| -0.167500000000074 | -1.089 | -0.545 | -0.363 |
| -0.165000000000074 | -1.085 | -0.542 | -0.362 |
| -0.162500000000074 | -1.08 | -0.54 | -0.36 |
| -0.160000000000074 | -1.075 | -0.538 | -0.358 |
| -0.157500000000074 | -1.071 | -0.535 | -0.357 |
| -0.155000000000074 | -1.066 | -0.533 | -0.355 |
| -0.152500000000074 | -1.062 | -0.531 | -0.354 |
| -0.150000000000074 | -1.057 | -0.529 | -0.352 |
| -0.147500000000074 | -1.053 | -0.527 | -0.351 |
| -0.145000000000074 | -1.049 | -0.524 | -0.35 |
| -0.142500000000074 | -1.045 | -0.522 | -0.348 |
| -0.140000000000074 | -1.04 | -0.52 | -0.347 |
| -0.137500000000074 | -1.036 | -0.518 | -0.345 |
| -0.135000000000074 | -1.032 | -0.516 | -0.344 |
| -0.132500000000074 | -1.028 | -0.514 | -0.343 |
| -0.130000000000074 | -1.024 | -0.512 | -0.341 |
| -0.127500000000074 | -1.02 | -0.51 | -0.34 |
| -0.125000000000074 | -1.016 | -0.508 | -0.339 |
| -0.122500000000074 | -1.012 | -0.506 | -0.337 |
| -0.120000000000074 | -1.008 | -0.504 | -0.336 |
| -0.117500000000074 | -1.005 | -0.502 | -0.335 |
| -0.115000000000074 | -1.001 | -0.5 | -0.334 |
| -0.112500000000074 | -0.997 | -0.499 | -0.332 |
| -0.110000000000074 | -0.994 | -0.497 | -0.331 |
| -0.107500000000074 | -0.99 | -0.495 | -0.33 |
| -0.105000000000074 | -0.986 | -0.493 | -0.329 |
| -0.102500000000074 | -0.983 | -0.491 | -0.328 |
| -0.100000000000074 | -0.979 | -0.49 | -0.326 |
| -0.0975000000000742 | -0.976 | -0.488 | -0.325 |
| -0.0950000000000742 | -0.972 | -0.486 | -0.324 |
| -0.0925000000000742 | -0.969 | -0.484 | -0.323 |
| -0.0900000000000742 | -0.965 | -0.483 | -0.322 |
| -0.0875000000000742 | -0.962 | -0.481 | -0.321 |
| -0.0850000000000742 | -0.959 | -0.479 | -0.32 |
| -0.0825000000000742 | -0.955 | -0.478 | -0.318 |
| -0.0800000000000742 | -0.952 | -0.476 | -0.317 |
| -0.0775000000000742 | -0.949 | -0.474 | -0.316 |
| -0.0750000000000742 | -0.946 | -0.473 | -0.315 |
| -0.0725000000000742 | -0.942 | -0.471 | -0.314 |
| -0.0700000000000742 | -0.939 | -0.47 | -0.313 |
| -0.0675000000000742 | -0.936 | -0.468 | -0.312 |
| -0.0650000000000742 | -0.933 | -0.466 | -0.311 |
| -0.0625000000000742 | -0.93 | -0.465 | -0.31 |
| -0.0600000000000742 | -0.927 | -0.463 | -0.309 |
| -0.0575000000000742 | -0.924 | -0.462 | -0.308 |
| -0.0550000000000742 | -0.921 | -0.46 | -0.307 |
| -0.0525000000000742 | -0.918 | -0.459 | -0.306 |
| -0.0500000000000742 | -0.915 | -0.457 | -0.305 |
| -0.0475000000000742 | -0.912 | -0.456 | -0.304 |
| -0.0450000000000742 | -0.909 | -0.455 | -0.303 |
| -0.0425000000000742 | -0.906 | -0.453 | -0.302 |
| -0.0400000000000742 | -0.903 | -0.452 | -0.301 |
| -0.0375000000000742 | -0.901 | -0.45 | -0.3 |
| -0.0350000000000742 | -0.898 | -0.449 | -0.299 |
| -0.0325000000000742 | -0.895 | -0.448 | -0.298 |
| -0.0300000000000742 | -0.892 | -0.446 | -0.297 |
| -0.0275000000000742 | -0.89 | -0.445 | -0.297 |
| -0.0250000000000742 | -0.887 | -0.443 | -0.296 |
| -0.0225000000000742 | -0.884 | -0.442 | -0.295 |
| -0.0200000000000742 | -0.881 | -0.441 | -0.294 |
| -0.0175000000000742 | -0.879 | -0.439 | -0.293 |
| -0.0150000000000742 | -0.876 | -0.438 | -0.292 |
| -0.0125000000000742 | -0.874 | -0.437 | -0.291 |
| -0.0100000000000742 | -0.871 | -0.435 | -0.29 |
| -0.0075000000000742 | -0.868 | -0.434 | -0.289 |
| -0.0050000000000742 | -0.866 | -0.433 | -0.289 |
| -0.0025000000000742 | -0.863 | -0.432 | -0.288 |
| -7.4196725152742e-14 | -0.861 | -0.43 | -0.287 |
| 0.0024999999999258 | -0.858 | -0.429 | -0.286 |
| 0.0049999999999258 | -0.856 | -0.428 | -0.285 |
| 0.0074999999999258 | -0.853 | -0.427 | -0.284 |
| 0.0099999999999258 | -0.851 | -0.425 | -0.284 |
| 0.0124999999999258 | -0.849 | -0.424 | -0.283 |
| 0.0149999999999258 | -0.846 | -0.423 | -0.282 |
| 0.0174999999999258 | -0.844 | -0.422 | -0.281 |
| 0.0199999999999258 | -0.841 | -0.421 | -0.28 |
| 0.0224999999999258 | -0.839 | -0.42 | -0.28 |
| 0.0249999999999258 | -0.837 | -0.418 | -0.279 |
| 0.0274999999999258 | -0.834 | -0.417 | -0.278 |
| 0.0299999999999258 | -0.832 | -0.416 | -0.277 |
| 0.0324999999999258 | -0.83 | -0.415 | -0.277 |
| 0.0349999999999258 | -0.828 | -0.414 | -0.276 |
| 0.0374999999999258 | -0.825 | -0.413 | -0.275 |
| 0.0399999999999258 | -0.823 | -0.412 | -0.274 |
| 0.0424999999999258 | -0.821 | -0.41 | -0.274 |
| 0.0449999999999258 | -0.819 | -0.409 | -0.273 |
| 0.0474999999999258 | -0.816 | -0.408 | -0.272 |
| 0.0499999999999258 | -0.814 | -0.407 | -0.271 |
| 0.0524999999999258 | -0.812 | -0.406 | -0.271 |
| 0.0549999999999258 | -0.81 | -0.405 | -0.27 |
| 0.0574999999999258 | -0.808 | -0.404 | -0.269 |
| 0.0599999999999258 | -0.806 | -0.403 | -0.269 |
| 0.0624999999999258 | -0.804 | -0.402 | -0.268 |
| 0.0649999999999258 | -0.802 | -0.401 | -0.267 |
| 0.0674999999999258 | -0.799 | -0.4 | -0.266 |
| 0.0699999999999258 | -0.797 | -0.399 | -0.266 |
| 0.0724999999999258 | -0.795 | -0.398 | -0.265 |
| 0.0749999999999258 | -0.793 | -0.397 | -0.264 |
| 0.0774999999999258 | -0.791 | -0.396 | -0.264 |
| 0.0799999999999258 | -0.789 | -0.395 | -0.263 |
| 0.0824999999999258 | -0.787 | -0.394 | -0.262 |
| 0.0849999999999258 | -0.785 | -0.393 | -0.262 |
| 0.0874999999999258 | -0.783 | -0.392 | -0.261 |
| 0.0899999999999258 | -0.781 | -0.391 | -0.26 |
| 0.0924999999999258 | -0.779 | -0.39 | -0.26 |
| 0.0949999999999258 | -0.777 | -0.389 | -0.259 |
| 0.0974999999999258 | -0.776 | -0.388 | -0.259 |
| 0.0999999999999258 | -0.774 | -0.387 | -0.258 |
| 0.102499999999926 | -0.772 | -0.386 | -0.257 |
| 0.104999999999926 | -0.77 | -0.385 | -0.257 |
| 0.107499999999926 | -0.768 | -0.384 | -0.256 |
| 0.109999999999926 | -0.766 | -0.383 | -0.255 |
| 0.112499999999926 | -0.764 | -0.382 | -0.255 |
| 0.114999999999926 | -0.762 | -0.381 | -0.254 |
| 0.117499999999926 | -0.761 | -0.38 | -0.254 |
| 0.119999999999926 | -0.759 | -0.379 | -0.253 |
| 0.122499999999926 | -0.757 | -0.378 | -0.252 |
| 0.124999999999926 | -0.755 | -0.378 | -0.252 |
| 0.127499999999926 | -0.753 | -0.377 | -0.251 |
| 0.129999999999926 | -0.751 | -0.376 | -0.25 |
| 0.132499999999926 | -0.75 | -0.375 | -0.25 |
| 0.134999999999926 | -0.748 | -0.374 | -0.249 |
| 0.137499999999926 | -0.746 | -0.373 | -0.249 |
| 0.139999999999926 | -0.744 | -0.372 | -0.248 |
| 0.142499999999926 | -0.743 | -0.371 | -0.248 |
| 0.144999999999926 | -0.741 | -0.371 | -0.247 |
| 0.147499999999926 | -0.739 | -0.37 | -0.246 |
| 0.149999999999926 | -0.738 | -0.369 | -0.246 |
| 0.152499999999926 | -0.736 | -0.368 | -0.245 |
| 0.154999999999926 | -0.734 | -0.367 | -0.245 |
| 0.157499999999926 | -0.733 | -0.366 | -0.244 |
| 0.159999999999926 | -0.731 | -0.365 | -0.244 |
| 0.162499999999926 | -0.729 | -0.365 | -0.243 |
| 0.164999999999926 | -0.728 | -0.364 | -0.243 |
| 0.167499999999926 | -0.726 | -0.363 | -0.242 |
| 0.169999999999926 | -0.724 | -0.362 | -0.241 |
| 0.172499999999926 | -0.723 | -0.361 | -0.241 |
| 0.174999999999926 | -0.721 | -0.361 | -0.24 |
| 0.177499999999926 | -0.719 | -0.36 | -0.24 |
| 0.179999999999926 | -0.718 | -0.359 | -0.239 |
| 0.182499999999926 | -0.716 | -0.358 | -0.239 |
| 0.184999999999926 | -0.715 | -0.357 | -0.238 |
| 0.187499999999926 | -0.713 | -0.357 | -0.238 |
| 0.189999999999926 | -0.712 | -0.356 | -0.237 |
| 0.192499999999926 | -0.71 | -0.355 | -0.237 |
| 0.194999999999926 | -0.708 | -0.354 | -0.236 |
| 0.197499999999926 | -0.707 | -0.353 | -0.236 |
| 0.199999999999926 | -0.705 | -0.353 | -0.235 |
| 0.202499999999926 | -0.704 | -0.352 | -0.235 |
| 0.204999999999926 | -0.702 | -0.351 | -0.234 |
| 0.207499999999926 | -0.701 | -0.35 | -0.234 |
| 0.209999999999926 | -0.699 | -0.35 | -0.233 |
| 0.212499999999926 | -0.698 | -0.349 | -0.233 |
| 0.214999999999926 | -0.696 | -0.348 | -0.232 |
| 0.217499999999926 | -0.695 | -0.347 | -0.232 |
| 0.219999999999926 | -0.693 | -0.347 | -0.231 |
| 0.222499999999926 | -0.692 | -0.346 | -0.231 |
| 0.224999999999926 | -0.691 | -0.345 | -0.23 |
| 0.227499999999926 | -0.689 | -0.345 | -0.23 |
| 0.229999999999926 | -0.688 | -0.344 | -0.229 |
| 0.232499999999926 | -0.686 | -0.343 | -0.229 |
| 0.234999999999926 | -0.685 | -0.342 | -0.228 |
| 0.237499999999926 | -0.683 | -0.342 | -0.228 |
| 0.239999999999926 | -0.682 | -0.341 | -0.227 |
| 0.242499999999926 | -0.681 | -0.34 | -0.227 |
| 0.244999999999926 | -0.679 | -0.34 | -0.226 |
| 0.247499999999926 | -0.678 | -0.339 | -0.226 |
| 0.249999999999926 | -0.676 | -0.338 | -0.225 |
| 0.252499999999926 | -0.675 | -0.338 | -0.225 |
| 0.254999999999926 | -0.674 | -0.337 | -0.225 |
| 0.257499999999926 | -0.672 | -0.336 | -0.224 |
| 0.259999999999926 | -0.671 | -0.335 | -0.224 |
| 0.262499999999926 | -0.67 | -0.335 | -0.223 |
| 0.264999999999926 | -0.668 | -0.334 | -0.223 |
| 0.267499999999926 | -0.667 | -0.333 | -0.222 |
| 0.269999999999926 | -0.666 | -0.333 | -0.222 |
| 0.272499999999926 | -0.664 | -0.332 | -0.221 |
| 0.274999999999926 | -0.663 | -0.331 | -0.221 |
| 0.277499999999926 | -0.662 | -0.331 | -0.221 |
| 0.279999999999926 | -0.66 | -0.33 | -0.22 |
| 0.282499999999926 | -0.659 | -0.33 | -0.22 |
| 0.284999999999926 | -0.658 | -0.329 | -0.219 |
| 0.287499999999926 | -0.656 | -0.328 | -0.219 |
| 0.289999999999926 | -0.655 | -0.328 | -0.218 |
| 0.292499999999926 | -0.654 | -0.327 | -0.218 |
| 0.294999999999926 | -0.653 | -0.326 | -0.218 |
| 0.297499999999926 | -0.651 | -0.326 | -0.217 |
| 0.299999999999926 | -0.65 | -0.325 | -0.217 |
| 0.302499999999926 | -0.649 | -0.324 | -0.216 |
| 0.304999999999926 | -0.648 | -0.324 | -0.216 |
| 0.307499999999926 | -0.646 | -0.323 | -0.215 |
| 0.309999999999926 | -0.645 | -0.323 | -0.215 |
| 0.312499999999926 | -0.644 | -0.322 | -0.215 |
| 0.314999999999926 | -0.643 | -0.321 | -0.214 |
| 0.317499999999926 | -0.641 | -0.321 | -0.214 |
| 0.319999999999926 | -0.64 | -0.32 | -0.213 |
| 0.322499999999926 | -0.639 | -0.32 | -0.213 |
| 0.324999999999926 | -0.638 | -0.319 | -0.213 |
| 0.327499999999926 | -0.637 | -0.318 | -0.212 |
| 0.329999999999926 | -0.635 | -0.318 | -0.212 |
| 0.332499999999926 | -0.634 | -0.317 | -0.211 |
| 0.334999999999926 | -0.633 | -0.317 | -0.211 |
| 0.337499999999926 | -0.632 | -0.316 | -0.211 |
| 0.339999999999926 | -0.631 | -0.315 | -0.21 |
| 0.342499999999926 | -0.63 | -0.315 | -0.21 |
| 0.344999999999926 | -0.628 | -0.314 | -0.209 |
| 0.347499999999926 | -0.627 | -0.314 | -0.209 |
| 0.349999999999926 | -0.626 | -0.313 | -0.209 |
| 0.352499999999926 | -0.625 | -0.312 | -0.208 |
| 0.354999999999926 | -0.624 | -0.312 | -0.208 |
| 0.357499999999926 | -0.623 | -0.311 | -0.208 |
| 0.359999999999926 | -0.621 | -0.311 | -0.207 |
| 0.362499999999926 | -0.62 | -0.31 | -0.207 |
| 0.364999999999926 | -0.619 | -0.31 | -0.206 |
| 0.367499999999926 | -0.618 | -0.309 | -0.206 |
| 0.369999999999926 | -0.617 | -0.309 | -0.206 |
| 0.372499999999926 | -0.616 | -0.308 | -0.205 |
| 0.374999999999926 | -0.615 | -0.307 | -0.205 |
| 0.377499999999926 | -0.614 | -0.307 | -0.205 |
| 0.379999999999926 | -0.613 | -0.306 | -0.204 |
| 0.382499999999926 | -0.612 | -0.306 | -0.204 |
| 0.384999999999926 | -0.61 | -0.305 | -0.203 |
| 0.387499999999926 | -0.609 | -0.305 | -0.203 |
| 0.389999999999926 | -0.608 | -0.304 | -0.203 |
| 0.392499999999926 | -0.607 | -0.304 | -0.202 |
| 0.394999999999926 | -0.606 | -0.303 | -0.202 |
| 0.397499999999926 | -0.605 | -0.303 | -0.202 |
| 0.399999999999926 | -0.604 | -0.302 | -0.201 |
| 0.402499999999926 | -0.603 | -0.301 | -0.201 |
| 0.404999999999926 | -0.602 | -0.301 | -0.201 |
| 0.407499999999926 | -0.601 | -0.3 | -0.2 |
| 0.409999999999926 | -0.6 | -0.3 | -0.2 |
| 0.412499999999926 | -0.599 | -0.299 | -0.2 |
| 0.414999999999926 | -0.598 | -0.299 | -0.199 |
| 0.417499999999926 | -0.597 | -0.298 | -0.199 |
| 0.419999999999926 | -0.596 | -0.298 | -0.199 |
| 0.422499999999926 | -0.595 | -0.297 | -0.198 |
| 0.424999999999926 | -0.594 | -0.297 | -0.198 |
| 0.427499999999926 | -0.593 | -0.296 | -0.198 |
| 0.429999999999926 | -0.592 | -0.296 | -0.197 |
| 0.432499999999926 | -0.591 | -0.295 | -0.197 |
| 0.434999999999926 | -0.59 | -0.295 | -0.197 |
| 0.437499999999926 | -0.589 | -0.294 | -0.196 |
| 0.439999999999926 | -0.588 | -0.294 | -0.196 |
| 0.442499999999926 | -0.587 | -0.293 | -0.196 |
| 0.444999999999926 | -0.586 | -0.293 | -0.195 |
| 0.447499999999926 | -0.585 | -0.292 | -0.195 |
| 0.449999999999926 | -0.584 | -0.292 | -0.195 |
| 0.452499999999926 | -0.583 | -0.291 | -0.194 |
| 0.454999999999926 | -0.582 | -0.291 | -0.194 |
| 0.457499999999926 | -0.581 | -0.29 | -0.194 |
| 0.459999999999926 | -0.58 | -0.29 | -0.193 |
| 0.462499999999926 | -0.579 | -0.289 | -0.193 |
| 0.464999999999926 | -0.578 | -0.289 | -0.193 |
| 0.467499999999926 | -0.577 | -0.288 | -0.192 |
| 0.469999999999926 | -0.576 | -0.288 | -0.192 |
| 0.472499999999926 | -0.575 | -0.287 | -0.192 |
| 0.474999999999926 | -0.574 | -0.287 | -0.191 |
| 0.477499999999926 | -0.573 | -0.287 | -0.191 |
| 0.479999999999926 | -0.572 | -0.286 | -0.191 |
| 0.482499999999926 | -0.571 | -0.286 | -0.19 |
| 0.484999999999926 | -0.57 | -0.285 | -0.19 |
| 0.487499999999926 | -0.569 | -0.285 | -0.19 |
| 0.489999999999926 | -0.568 | -0.284 | -0.189 |
| 0.492499999999926 | -0.567 | -0.284 | -0.189 |
| 0.494999999999926 | -0.567 | -0.283 | -0.189 |
| 0.497499999999926 | -0.566 | -0.283 | -0.189 |
| 0.499999999999926 | -0.565 | -0.282 | -0.188 |
| 0.502499999999926 | -0.564 | -0.282 | -0.188 |
| 0.504999999999926 | -0.563 | -0.281 | -0.188 |
| 0.507499999999926 | -0.562 | -0.281 | -0.187 |
| 0.509999999999926 | -0.561 | -0.281 | -0.187 |
| 0.512499999999926 | -0.56 | -0.28 | -0.187 |
| 0.514999999999926 | -0.559 | -0.28 | -0.186 |
| 0.517499999999926 | -0.558 | -0.279 | -0.186 |
| 0.519999999999926 | -0.558 | -0.279 | -0.186 |
| 0.522499999999926 | -0.557 | -0.278 | -0.186 |
| 0.524999999999926 | -0.556 | -0.278 | -0.185 |
| 0.527499999999926 | -0.555 | -0.277 | -0.185 |
| 0.529999999999926 | -0.554 | -0.277 | -0.185 |
| 0.532499999999925 | -0.553 | -0.277 | -0.184 |
| 0.534999999999925 | -0.552 | -0.276 | -0.184 |
| 0.537499999999925 | -0.551 | -0.276 | -0.184 |
| 0.539999999999925 | -0.551 | -0.275 | -0.184 |
| 0.542499999999925 | -0.55 | -0.275 | -0.183 |
| 0.544999999999925 | -0.549 | -0.274 | -0.183 |
| 0.547499999999925 | -0.548 | -0.274 | -0.183 |
| 0.549999999999925 | -0.547 | -0.274 | -0.182 |
| 0.552499999999925 | -0.546 | -0.273 | -0.182 |
| 0.554999999999925 | -0.546 | -0.273 | -0.182 |
| 0.557499999999925 | -0.545 | -0.272 | -0.182 |
| 0.559999999999925 | -0.544 | -0.272 | -0.181 |
| 0.562499999999925 | -0.543 | -0.271 | -0.181 |
| 0.564999999999925 | -0.542 | -0.271 | -0.181 |
| 0.567499999999925 | -0.541 | -0.271 | -0.18 |
| 0.569999999999925 | -0.541 | -0.27 | -0.18 |
| 0.572499999999925 | -0.54 | -0.27 | -0.18 |
| 0.574999999999925 | -0.539 | -0.269 | -0.18 |
| 0.577499999999925 | -0.538 | -0.269 | -0.179 |
| 0.579999999999924 | -0.537 | -0.269 | -0.179 |
| 0.582499999999924 | -0.536 | -0.268 | -0.179 |
| 0.584999999999924 | -0.536 | -0.268 | -0.179 |
| 0.587499999999924 | -0.535 | -0.267 | -0.178 |
| 0.589999999999924 | -0.534 | -0.267 | -0.178 |
| 0.592499999999924 | -0.533 | -0.267 | -0.178 |
| 0.594999999999924 | -0.532 | -0.266 | -0.177 |
| 0.597499999999924 | -0.532 | -0.266 | -0.177 |
| 0.599999999999924 | -0.531 | -0.265 | -0.177 |
| 0.602499999999924 | -0.53 | -0.265 | -0.177 |
| 0.604999999999924 | -0.529 | -0.265 | -0.176 |
| 0.607499999999924 | -0.528 | -0.264 | -0.176 |
| 0.609999999999924 | -0.528 | -0.264 | -0.176 |
| 0.612499999999924 | -0.527 | -0.263 | -0.176 |
| 0.614999999999924 | -0.526 | -0.263 | -0.175 |
| 0.617499999999924 | -0.525 | -0.263 | -0.175 |
| 0.619999999999924 | -0.525 | -0.262 | -0.175 |
| 0.622499999999923 | -0.524 | -0.262 | -0.175 |
| 0.624999999999923 | -0.523 | -0.262 | -0.174 |
| 0.627499999999923 | -0.522 | -0.261 | -0.174 |
| 0.629999999999923 | -0.522 | -0.261 | -0.174 |
| 0.632499999999923 | -0.521 | -0.26 | -0.174 |
| 0.634999999999923 | -0.52 | -0.26 | -0.173 |
| 0.637499999999923 | -0.519 | -0.26 | -0.173 |
| 0.639999999999923 | -0.518 | -0.259 | -0.173 |
| 0.642499999999923 | -0.518 | -0.259 | -0.173 |
| 0.644999999999923 | -0.517 | -0.259 | -0.172 |
| 0.647499999999923 | -0.516 | -0.258 | -0.172 |
| 0.649999999999923 | -0.516 | -0.258 | -0.172 |
| 0.652499999999923 | -0.515 | -0.257 | -0.172 |
| 0.654999999999923 | -0.514 | -0.257 | -0.171 |
| 0.657499999999923 | -0.513 | -0.257 | -0.171 |
| 0.659999999999923 | -0.513 | -0.256 | -0.171 |
| 0.662499999999923 | -0.512 | -0.256 | -0.171 |
| 0.664999999999923 | -0.511 | -0.256 | -0.17 |
| 0.667499999999922 | -0.51 | -0.255 | -0.17 |
| 0.669999999999922 | -0.51 | -0.255 | -0.17 |
| 0.672499999999922 | -0.509 | -0.254 | -0.17 |
| 0.674999999999922 | -0.508 | -0.254 | -0.169 |
| 0.677499999999922 | -0.507 | -0.254 | -0.169 |
| 0.679999999999922 | -0.507 | -0.253 | -0.169 |
| 0.682499999999922 | -0.506 | -0.253 | -0.169 |
| 0.684999999999922 | -0.505 | -0.253 | -0.168 |
| 0.687499999999922 | -0.505 | -0.252 | -0.168 |
| 0.689999999999922 | -0.504 | -0.252 | -0.168 |
| 0.692499999999922 | -0.503 | -0.252 | -0.168 |
| 0.694999999999922 | -0.503 | -0.251 | -0.168 |
| 0.697499999999922 | -0.502 | -0.251 | -0.167 |
| 0.699999999999922 | -0.501 | -0.251 | -0.167 |
| 0.702499999999922 | -0.5 | -0.25 | -0.167 |
| 0.704999999999922 | -0.5 | -0.25 | -0.167 |
| 0.707499999999922 | -0.499 | -0.25 | -0.166 |
| 0.709999999999922 | -0.498 | -0.249 | -0.166 |
| 0.712499999999922 | -0.498 | -0.249 | -0.166 |
| 0.714999999999922 | -0.497 | -0.249 | -0.166 |
| 0.717499999999921 | -0.496 | -0.248 | -0.165 |
| 0.719999999999921 | -0.496 | -0.248 | -0.165 |
| 0.722499999999921 | -0.495 | -0.247 | -0.165 |
| 0.724999999999921 | -0.494 | -0.247 | -0.165 |
| 0.727499999999921 | -0.494 | -0.247 | -0.165 |
| 0.729999999999921 | -0.493 | -0.246 | -0.164 |
| 0.732499999999921 | -0.492 | -0.246 | -0.164 |
| 0.734999999999921 | -0.492 | -0.246 | -0.164 |
| 0.737499999999921 | -0.491 | -0.245 | -0.164 |
| 0.739999999999921 | -0.49 | -0.245 | -0.163 |
| 0.742499999999921 | -0.49 | -0.245 | -0.163 |
| 0.744999999999921 | -0.489 | -0.244 | -0.163 |
| 0.747499999999921 | -0.488 | -0.244 | -0.163 |
| 0.749999999999921 | -0.488 | -0.244 | -0.163 |
| 0.752499999999921 | -0.487 | -0.243 | -0.162 |
| 0.754999999999921 | -0.486 | -0.243 | -0.162 |
| 0.757499999999921 | -0.486 | -0.243 | -0.162 |
| 0.759999999999921 | -0.485 | -0.243 | -0.162 |
| 0.76249999999992 | -0.484 | -0.242 | -0.161 |
| 0.76499999999992 | -0.484 | -0.242 | -0.161 |
| 0.76749999999992 | -0.483 | -0.242 | -0.161 |
| 0.76999999999992 | -0.482 | -0.241 | -0.161 |
| 0.77249999999992 | -0.482 | -0.241 | -0.161 |
| 0.77499999999992 | -0.481 | -0.241 | -0.16 |
| 0.77749999999992 | -0.481 | -0.24 | -0.16 |
| 0.77999999999992 | -0.48 | -0.24 | -0.16 |
| 0.78249999999992 | -0.479 | -0.24 | -0.16 |
| 0.78499999999992 | -0.479 | -0.239 | -0.16 |
| 0.78749999999992 | -0.478 | -0.239 | -0.159 |
| 0.78999999999992 | -0.477 | -0.239 | -0.159 |
| 0.79249999999992 | -0.477 | -0.238 | -0.159 |
| 0.79499999999992 | -0.476 | -0.238 | -0.159 |
| 0.79749999999992 | -0.476 | -0.238 | -0.159 |
| 0.79999999999992 | -0.475 | -0.237 | -0.158 |
| 0.80249999999992 | -0.474 | -0.237 | -0.158 |
| 0.80499999999992 | -0.474 | -0.237 | -0.158 |
| 0.80749999999992 | -0.473 | -0.237 | -0.158 |
| 0.80999999999992 | -0.472 | -0.236 | -0.157 |
| 0.812499999999919 | -0.472 | -0.236 | -0.157 |
| 0.814999999999919 | -0.471 | -0.236 | -0.157 |
| 0.817499999999919 | -0.471 | -0.235 | -0.157 |
| 0.819999999999919 | -0.47 | -0.235 | -0.157 |
| 0.822499999999919 | -0.469 | -0.235 | -0.156 |
| 0.824999999999919 | -0.469 | -0.234 | -0.156 |
| 0.827499999999919 | -0.468 | -0.234 | -0.156 |
| 0.829999999999919 | -0.468 | -0.234 | -0.156 |
| 0.832499999999919 | -0.467 | -0.233 | -0.156 |
| 0.834999999999919 | -0.466 | -0.233 | -0.155 |
| 0.837499999999919 | -0.466 | -0.233 | -0.155 |
| 0.839999999999919 | -0.465 | -0.233 | -0.155 |
| 0.842499999999919 | -0.465 | -0.232 | -0.155 |
| 0.844999999999919 | -0.464 | -0.232 | -0.155 |
| 0.847499999999919 | -0.463 | -0.232 | -0.154 |
| 0.849999999999919 | -0.463 | -0.231 | -0.154 |
| 0.852499999999919 | -0.462 | -0.231 | -0.154 |
| 0.854999999999919 | -0.462 | -0.231 | -0.154 |
| 0.857499999999918 | -0.461 | -0.231 | -0.154 |
| 0.859999999999918 | -0.461 | -0.23 | -0.154 |
| 0.862499999999918 | -0.46 | -0.23 | -0.153 |
| 0.864999999999918 | -0.459 | -0.23 | -0.153 |
| 0.867499999999918 | -0.459 | -0.229 | -0.153 |
| 0.869999999999918 | -0.458 | -0.229 | -0.153 |
| 0.872499999999918 | -0.458 | -0.229 | -0.153 |
| 0.874999999999918 | -0.457 | -0.229 | -0.152 |
| 0.877499999999918 | -0.457 | -0.228 | -0.152 |
| 0.879999999999918 | -0.456 | -0.228 | -0.152 |
| 0.882499999999918 | -0.455 | -0.228 | -0.152 |
| 0.884999999999918 | -0.455 | -0.227 | -0.152 |
| 0.887499999999918 | -0.454 | -0.227 | -0.151 |
| 0.889999999999918 | -0.454 | -0.227 | -0.151 |
| 0.892499999999918 | -0.453 | -0.227 | -0.151 |
| 0.894999999999918 | -0.453 | -0.226 | -0.151 |
| 0.897499999999918 | -0.452 | -0.226 | -0.151 |
| 0.899999999999918 | -0.451 | -0.226 | -0.15 |
| 0.902499999999918 | -0.451 | -0.225 | -0.15 |
| 0.904999999999918 | -0.45 | -0.225 | -0.15 |
| 0.907499999999917 | -0.45 | -0.225 | -0.15 |
| 0.909999999999917 | -0.449 | -0.225 | -0.15 |
| 0.912499999999917 | -0.449 | -0.224 | -0.15 |
| 0.914999999999917 | -0.448 | -0.224 | -0.149 |
| 0.917499999999917 | -0.448 | -0.224 | -0.149 |
| 0.919999999999917 | -0.447 | -0.224 | -0.149 |
| 0.922499999999917 | -0.447 | -0.223 | -0.149 |
| 0.924999999999917 | -0.446 | -0.223 | -0.149 |
| 0.927499999999917 | -0.445 | -0.223 | -0.148 |
| 0.929999999999917 | -0.445 | -0.222 | -0.148 |
| 0.932499999999917 | -0.444 | -0.222 | -0.148 |
| 0.934999999999917 | -0.444 | -0.222 | -0.148 |
| 0.937499999999917 | -0.443 | -0.222 | -0.148 |
| 0.939999999999917 | -0.443 | -0.221 | -0.148 |
| 0.942499999999917 | -0.442 | -0.221 | -0.147 |
| 0.944999999999917 | -0.442 | -0.221 | -0.147 |
| 0.947499999999917 | -0.441 | -0.221 | -0.147 |
| 0.949999999999917 | -0.441 | -0.22 | -0.147 |
| 0.952499999999916 | -0.44 | -0.22 | -0.147 |
| 0.954999999999916 | -0.44 | -0.22 | -0.147 |
| 0.957499999999916 | -0.439 | -0.22 | -0.146 |
| 0.959999999999916 | -0.439 | -0.219 | -0.146 |
| 0.962499999999916 | -0.438 | -0.219 | -0.146 |
| 0.964999999999916 | -0.438 | -0.219 | -0.146 |
| 0.967499999999916 | -0.437 | -0.219 | -0.146 |
| 0.969999999999916 | -0.437 | -0.218 | -0.146 |
| 0.972499999999916 | -0.436 | -0.218 | -0.145 |
| 0.974999999999916 | -0.435 | -0.218 | -0.145 |
| 0.977499999999916 | -0.435 | -0.217 | -0.145 |
| 0.979999999999916 | -0.434 | -0.217 | -0.145 |
| 0.982499999999916 | -0.434 | -0.217 | -0.145 |
| 0.984999999999916 | -0.433 | -0.217 | -0.144 |
| 0.987499999999916 | -0.433 | -0.216 | -0.144 |
| 0.989999999999916 | -0.432 | -0.216 | -0.144 |
| 0.992499999999916 | -0.432 | -0.216 | -0.144 |
| 0.994999999999916 | -0.431 | -0.216 | -0.144 |
| 0.997499999999916 | -0.431 | -0.215 | -0.144 |
| 0.999999999999915 | -0.43 | -0.215 | -0.143 |